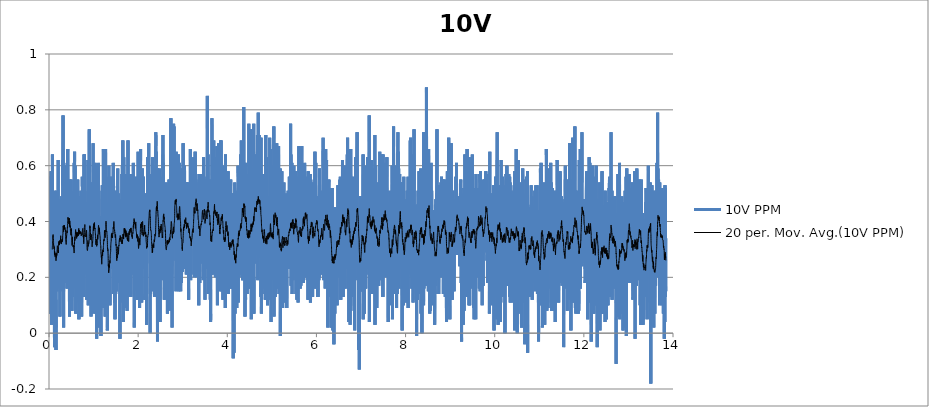
| Category | 10V PPM |
|---|---|
| 0.01620481575 | 0.37 |
| 0.019264157416666667 | 0.26 |
| 0.022323499055555557 | 0.07 |
| 0.025382562916666667 | 0.15 |
| 0.028442737944444445 | 0.22 |
| 0.03150207961111111 | 0.07 |
| 0.03456142125 | 0.56 |
| 0.03762076291666666 | 0.16 |
| 0.040680104555555555 | 0.38 |
| 0.04373944622222222 | 0.58 |
| 0.04679878786111111 | 0.25 |
| 0.04985785172222222 | 0.42 |
| 0.05291747116666667 | 0.34 |
| 0.055977090611111106 | 0.03 |
| 0.05903643225 | 0.39 |
| 0.062096329500000005 | 0.46 |
| 0.0651553933611111 | 0.27 |
| 0.0682155683888889 | 0.29 |
| 0.07127546561111112 | 0.44 |
| 0.07433452947222222 | 0.29 |
| 0.07739387113888889 | 0.64 |
| 0.08045349058333334 | 0.3 |
| 0.08351283222222222 | 0.38 |
| 0.0865721738888889 | 0.49 |
| 0.08963123775 | 0.2 |
| 0.09269085719444445 | 0.19 |
| 0.09575019883333334 | 0.2 |
| 0.09880926269444444 | 0.21 |
| 0.10186999330555556 | 0.21 |
| 0.10492933497222222 | 0.23 |
| 0.10798839880555555 | 0.29 |
| 0.11104774047222221 | 0.21 |
| 0.11410735991666666 | 0.33 |
| 0.11716781274999999 | 0.15 |
| 0.12022715438888888 | 0.37 |
| 0.12328677383333334 | -0.05 |
| 0.12634611547222221 | 0.25 |
| 0.12940545713888887 | 0.51 |
| 0.132464521 | 0.26 |
| 0.13552441822222222 | 0.27 |
| 0.13858375988888888 | 0.45 |
| 0.1416431015277778 | 0.47 |
| 0.14470244319444445 | 0.47 |
| 0.14776178483333335 | 0.48 |
| 0.15082112649999999 | 0.02 |
| 0.15388157930555554 | 0.12 |
| 0.15694064316666667 | -0.06 |
| 0.15999998483333333 | 0.33 |
| 0.1630604376388889 | 0.41 |
| 0.16611977930555558 | 0.19 |
| 0.16917884316666668 | 0.26 |
| 0.17223790700000002 | 0.51 |
| 0.17529752644444443 | 0.15 |
| 0.1783568681111111 | 0.39 |
| 0.18141593197222222 | 0.44 |
| 0.18447527361111113 | 0.16 |
| 0.18753461527777776 | 0.43 |
| 0.1905936791111111 | 0.46 |
| 0.19365274297222224 | 0.21 |
| 0.19671264022222223 | 0.26 |
| 0.19977198186111111 | 0.17 |
| 0.20283104572222224 | 0.37 |
| 0.20589010958333334 | 0.62 |
| 0.20894945125 | 0.31 |
| 0.21200934847222222 | 0.48 |
| 0.21506924572222222 | 0.16 |
| 0.21812969852777778 | 0.24 |
| 0.22118904019444444 | 0.27 |
| 0.22424865963888888 | 0.26 |
| 0.22730800127777778 | 0.35 |
| 0.23036706513888888 | 0.34 |
| 0.23342696238888888 | 0.24 |
| 0.2364863040277778 | 0.47 |
| 0.2395453678888889 | 0.32 |
| 0.24260498733333333 | 0.41 |
| 0.2456643289722222 | 0.06 |
| 0.2487236706388889 | 0.43 |
| 0.2517830122777778 | 0.47 |
| 0.2548429095277778 | 0.3 |
| 0.25790225116666665 | 0.48 |
| 0.2609618706111111 | 0.35 |
| 0.2640209344722222 | 0.4 |
| 0.2670802761388889 | 0.29 |
| 0.27013934 | 0.36 |
| 0.2731992372222222 | 0.26 |
| 0.2762583010833333 | 0.15 |
| 0.27931792052777776 | 0.18 |
| 0.2823772621666667 | 0.49 |
| 0.2854374372222222 | 0.16 |
| 0.2884970566666667 | 0.42 |
| 0.2915566761111111 | 0.47 |
| 0.29461657333333335 | 0.27 |
| 0.2976756371944444 | 0.38 |
| 0.30073497883333333 | 0.23 |
| 0.3037940426944445 | 0.46 |
| 0.3068533843611111 | 0.34 |
| 0.309912726 | 0.62 |
| 0.31297429 | 0.53 |
| 0.31604002091666666 | 0.78 |
| 0.3190996403611111 | 0.46 |
| 0.3221592598055556 | 0.45 |
| 0.32521887925 | 0.23 |
| 0.3282796098611111 | 0.02 |
| 0.3313403404722222 | 0.61 |
| 0.33440023772222227 | 0.19 |
| 0.3374601349722222 | 0.36 |
| 0.34052086558333333 | 0.27 |
| 0.34358131841666667 | 0.18 |
| 0.3466417712222222 | 0.44 |
| 0.3497011128888889 | 0.22 |
| 0.3527632324722222 | 0.42 |
| 0.3558228519166667 | 0.4 |
| 0.35888330475 | 0.25 |
| 0.36194570211111116 | 0.23 |
| 0.36501421097222225 | 0.48 |
| 0.36807605275 | 0.3 |
| 0.37114261705555557 | 0.5 |
| 0.3742025142777778 | 0.24 |
| 0.3772626893055555 | 0.38 |
| 0.38032453111111114 | 0.44 |
| 0.3833844283333333 | 0.27 |
| 0.38644543675 | 0.19 |
| 0.38950700075 | 0.6 |
| 0.3925688425555556 | 0.46 |
| 0.39562985097222225 | 0.38 |
| 0.3986961374722222 | 0.38 |
| 0.40175603469444443 | 0.57 |
| 0.40481593194444443 | 0.16 |
| 0.4078777737222222 | 0.31 |
| 0.41093878213888885 | 0.57 |
| 0.4139986793888889 | 0.52 |
| 0.41705913219444446 | 0.33 |
| 0.42011875163888884 | 0.66 |
| 0.42317809330555556 | 0.54 |
| 0.42623743494444444 | 0.43 |
| 0.4292970543888889 | 0.34 |
| 0.4323566738333333 | 0.33 |
| 0.43541712666666665 | 0.22 |
| 0.43847674611111115 | 0.37 |
| 0.4415388656944444 | 0.2 |
| 0.4445984851388889 | 0.43 |
| 0.44765782680555555 | 0.44 |
| 0.4507188352222222 | 0.49 |
| 0.45378539949999996 | 0.44 |
| 0.4568447411388889 | 0.49 |
| 0.4599040828055555 | 0.06 |
| 0.46296370225 | 0.31 |
| 0.46602415505555556 | 0.55 |
| 0.4690837745 | 0.23 |
| 0.4721433939722222 | 0.29 |
| 0.4752024578055556 | 0.42 |
| 0.4782617994722222 | 0.45 |
| 0.48132225230555553 | 0.25 |
| 0.48438187175 | 0.38 |
| 0.48744093558333335 | 0.38 |
| 0.4905005550277778 | 0.34 |
| 0.49355989669444444 | 0.29 |
| 0.49661896055555554 | 0.55 |
| 0.4996791355833333 | 0.33 |
| 0.5027387550277778 | 0.38 |
| 0.5057980966666666 | 0.16 |
| 0.5088577161111111 | 0.24 |
| 0.5119170577777777 | 0.3 |
| 0.5149763994166666 | 0.08 |
| 0.5180357410833333 | 0.3 |
| 0.5210950827222223 | 0.51 |
| 0.5241549799722222 | 0.46 |
| 0.5272143216111111 | 0.13 |
| 0.5302736632777778 | 0.23 |
| 0.5333330049166667 | 0.16 |
| 0.5363920687777778 | 0.37 |
| 0.5394514104166667 | 0.33 |
| 0.5425110298611111 | 0.29 |
| 0.5455706493055555 | 0.48 |
| 0.5486299909722222 | 0.31 |
| 0.5516904437777778 | 0.17 |
| 0.5547497854444444 | 0.23 |
| 0.5578096826666666 | 0.51 |
| 0.5608693021111111 | 0.26 |
| 0.5639291993611111 | 0.23 |
| 0.5669888188055555 | 0.61 |
| 0.5700489938333333 | 0.24 |
| 0.5731083355 | 0.65 |
| 0.5761676771388888 | 0.33 |
| 0.5792275743888889 | 0.4 |
| 0.5822869160277778 | 0.25 |
| 0.5853487578333333 | 0.6 |
| 0.5884086550555556 | 0.36 |
| 0.5914679967222223 | 0.3 |
| 0.5945273383611112 | 0.39 |
| 0.5975869578055555 | 0.48 |
| 0.60064657725 | 0.07 |
| 0.6037061966944445 | 0.39 |
| 0.6067652605555556 | 0.16 |
| 0.60982488 | 0.36 |
| 0.6128842216388889 | 0.28 |
| 0.6159438410833333 | 0.33 |
| 0.6190029049444444 | 0.11 |
| 0.6220628021944444 | 0.34 |
| 0.6251221438333333 | 0.52 |
| 0.6281820410833333 | 0.43 |
| 0.6312411049444444 | 0.36 |
| 0.634300724388889 | 0.48 |
| 0.6373608994166666 | 0.43 |
| 0.6404199632777777 | 0.3 |
| 0.6434793049166666 | 0.55 |
| 0.6465386465833333 | 0.4 |
| 0.6495990993888889 | 0.28 |
| 0.6526584410555555 | 0.49 |
| 0.6557175049166666 | 0.42 |
| 0.6587768465555556 | 0.29 |
| 0.6618359104166667 | 0.47 |
| 0.6648949742777778 | 0.24 |
| 0.6679545937222223 | 0.43 |
| 0.6710139353611111 | 0.05 |
| 0.6740732770277779 | 0.29 |
| 0.6771323408888889 | 0.2 |
| 0.6801922381111111 | 0.4 |
| 0.6832515797777777 | 0.27 |
| 0.6863109214166666 | 0.46 |
| 0.6893699852777778 | 0.3 |
| 0.6924296047222221 | 0.37 |
| 0.6954892241666667 | 0.49 |
| 0.6985499547777778 | 0.42 |
| 0.7016106854166666 | 0.43 |
| 0.7046700270555555 | 0.49 |
| 0.7077302020833333 | 0.48 |
| 0.7107903771111111 | 0.29 |
| 0.7138497187777778 | 0.35 |
| 0.7169090604166667 | 0.51 |
| 0.7199684020833333 | 0.16 |
| 0.7230277437222222 | 0.34 |
| 0.7260868075833333 | 0.28 |
| 0.7291461492222222 | 0.47 |
| 0.7322060464722222 | 0.06 |
| 0.7352651103333334 | 0.32 |
| 0.7383244519722223 | 0.25 |
| 0.741383793638889 | 0.3 |
| 0.7444439686666667 | 0.32 |
| 0.7475030325277777 | 0.56 |
| 0.7505623741666667 | 0.48 |
| 0.7536222714166667 | 0.45 |
| 0.756681890861111 | 0.53 |
| 0.7597412324999999 | 0.43 |
| 0.7628005741666666 | 0.29 |
| 0.765859638 | 0.23 |
| 0.7689189796666668 | 0.26 |
| 0.7719780435277778 | 0.44 |
| 0.7750371073888889 | 0.13 |
| 0.7780964490277777 | 0.13 |
| 0.7811560684722223 | 0.18 |
| 0.7842151323333333 | 0.58 |
| 0.7872805854444445 | 0.64 |
| 0.7903402048888889 | 0.37 |
| 0.7934001021111111 | 0.64 |
| 0.7964627773055555 | 0.39 |
| 0.7995229523333333 | 0.27 |
| 0.8025836829444445 | 0.45 |
| 0.8056483026944444 | 0.3 |
| 0.8087073665277777 | 0.32 |
| 0.8117678193611111 | 0.21 |
| 0.8148282721944444 | 0.41 |
| 0.8179112263055556 | 0.38 |
| 0.8210047365833334 | 0.35 |
| 0.8240715786666667 | 0.22 |
| 0.8271378651388889 | 0.3 |
| 0.8302341533611111 | 0.28 |
| 0.8332948839722222 | 0.36 |
| 0.8363586703333333 | 0.44 |
| 0.8394296793055556 | 0.23 |
| 0.8424995771111111 | 0.24 |
| 0.8455630856666667 | 0.35 |
| 0.8486377059722222 | 0.12 |
| 0.8517070481944444 | 0.21 |
| 0.8547772238055555 | 0.21 |
| 0.8578462882222223 | 0.36 |
| 0.8609147970833333 | 0.18 |
| 0.8639855282777777 | 0.47 |
| 0.8670629264999999 | 0.4 |
| 0.8701283796111111 | 0.51 |
| 0.8731957772777778 | 0.62 |
| 0.8762559523055555 | 0.2 |
| 0.8793405731944444 | 0.42 |
| 0.882412971138889 | 0.1 |
| 0.8854831467500001 | 0.36 |
| 0.888550266611111 | 0.34 |
| 0.8916207200277778 | 0.26 |
| 0.89468533975 | 0.44 |
| 0.8977502372777778 | 0.44 |
| 0.9008168015555555 | 0.43 |
| 0.9038803101111111 | 0.73 |
| 0.9069743759722222 | 0.48 |
| 0.9100401068888888 | 0.39 |
| 0.9131016708888888 | 0.21 |
| 0.9161707353055556 | 0.36 |
| 0.9192364662222222 | 0.18 |
| 0.9223096975555556 | 0.3 |
| 0.9253823733055555 | 0.37 |
| 0.92844671525 | 0.31 |
| 0.9315141129166666 | 0.16 |
| 0.9346031784722223 | 0.2 |
| 0.93768391025 | 0.49 |
| 0.9407485299722222 | 0.4 |
| 0.9438209279166666 | 0.06 |
| 0.9468924925 | 0.36 |
| 0.9499568344444445 | 0.51 |
| 0.9530231209166666 | 0.07 |
| 0.9560907963888889 | 0.43 |
| 0.9591590274444444 | 0.18 |
| 0.9622339255277779 | 0.38 |
| 0.9653029899722223 | 0.44 |
| 0.9683670541111111 | 0.38 |
| 0.9714330628055556 | 0.54 |
| 0.9744946268055557 | 0.38 |
| 0.9775598021111112 | 0.31 |
| 0.9806277553888889 | 0.34 |
| 0.9836982087777778 | 0.39 |
| 0.9867617173333334 | 0.59 |
| 0.9898296705833333 | 0.68 |
| 0.9929040130833333 | 0.35 |
| 0.9959686328333333 | 0.37 |
| 0.9990457532777778 | 0.36 |
| 1.0021114841666665 | 0.23 |
| 1.0051797152222222 | 0.55 |
| 1.0082732255 | 0.19 |
| 1.0113453456666666 | 0.3 |
| 1.0144141323055555 | 0.33 |
| 1.017506531388889 | 0.59 |
| 1.0205739290555556 | 0.21 |
| 1.0236579943333333 | 0.07 |
| 1.02672372525 | 0.4 |
| 1.029811401861111 | 0.28 |
| 1.032892967 | 0.61 |
| 1.0359750877222222 | 0.19 |
| 1.0390497080277779 | 0.18 |
| 1.0421309953888889 | 0.16 |
| 1.0452078380277778 | 0.36 |
| 1.0482696798333333 | 0.11 |
| 1.0513426333611111 | 0.49 |
| 1.0544441996666667 | 0.45 |
| 1.05753659875 | 0.49 |
| 1.0606017740833333 | 0.46 |
| 1.0636813946666666 | 0.3 |
| 1.0667543481944444 | 0.26 |
| 1.0698203569166667 | -0.02 |
| 1.072900810861111 | 0.42 |
| 1.0759909876111111 | 0.38 |
| 1.079068385861111 | 0.51 |
| 1.0821452285 | 0.29 |
| 1.0852242935 | 0.38 |
| 1.0883314156666666 | 0.6 |
| 1.0913993689166668 | 0.42 |
| 1.0944737114444445 | 0.29 |
| 1.0975466649722223 | 0.34 |
| 1.1006465645 | 0.32 |
| 1.1037395191944444 | 0.38 |
| 1.1068299737222222 | 0.61 |
| 1.1099054274166666 | 0.34 |
| 1.1130056047222223 | 0.48 |
| 1.1160841141388889 | 0.2 |
| 1.1191570676944445 | 0.51 |
| 1.1222719680833333 | 0.38 |
| 1.1253426992777777 | 0.02 |
| 1.1284198197222222 | 0.39 |
| 1.1314986069166666 | 0.29 |
| 1.1345998954166667 | 0.14 |
| 1.1376775714444445 | 0.33 |
| 1.1407677481944445 | 0.32 |
| 1.143864592 | 0.26 |
| 1.1469633803333332 | 0.26 |
| 1.150034667111111 | 0.41 |
| 1.1530981756666667 | 0.2 |
| 1.1561677956944443 | 0.18 |
| 1.1592404714444446 | 0.27 |
| 1.1623070357222223 | 0.28 |
| 1.1653749889722222 | -0.01 |
| 1.1684454423888888 | 0.42 |
| 1.17151728475 | 0.32 |
| 1.1745807933055554 | 0.25 |
| 1.1776495799444446 | 0.34 |
| 1.1807283671388888 | 0.17 |
| 1.183796876 | 0.1 |
| 1.1868745520277777 | 0.4 |
| 1.1899419496944446 | 0.42 |
| 1.1930087917777779 | 0.35 |
| 1.1960803563333333 | 0.53 |
| 1.199141086972222 | 0.29 |
| 1.2022040399166667 | 0.09 |
| 1.2052689374444445 | 0.47 |
| 1.2083402242222223 | 0.5 |
| 1.2114126221944443 | 0.25 |
| 1.2144758529444446 | 0.3 |
| 1.2175410282777777 | 0.09 |
| 1.2206195376666666 | 0.66 |
| 1.2236849907777776 | 0.36 |
| 1.226747110388889 | 0.32 |
| 1.2298114523055557 | 0.38 |
| 1.2328738496944445 | 0.45 |
| 1.2359351359166666 | 0.16 |
| 1.2390130897222222 | 0.46 |
| 1.2420793762222222 | 0.34 |
| 1.2451409402222222 | 0.52 |
| 1.2482086156944443 | 0.34 |
| 1.25127212425 | 0.49 |
| 1.2543372995555557 | 0.14 |
| 1.2574005303333333 | 0.46 |
| 1.2604654278333334 | 0.06 |
| 1.2635375480000002 | 0.42 |
| 1.2666024455277778 | 0.53 |
| 1.2696676208333333 | 0.66 |
| 1.2727280736666666 | 0.25 |
| 1.27579491575 | 0.46 |
| 1.2788553685833333 | 0.56 |
| 1.2819174881666666 | 0.43 |
| 1.2849804411388888 | 0.12 |
| 1.2880447830833333 | 0.26 |
| 1.2911080138333333 | 0.15 |
| 1.2941693000277776 | 0.47 |
| 1.297237808888889 | 0.17 |
| 1.3002988173055554 | 0.25 |
| 1.3033606590833333 | 0.29 |
| 1.3064227786666667 | 0.29 |
| 1.3094862872222222 | 0.01 |
| 1.3125764639722222 | 0.06 |
| 1.315646917388889 | 0.22 |
| 1.3187112593055557 | 0.24 |
| 1.3217733789166666 | 0.16 |
| 1.3248496659722224 | 0.15 |
| 1.3279128967222222 | 0.15 |
| 1.3309814055833333 | 0.12 |
| 1.334059081611111 | 0.38 |
| 1.3371187010555556 | 0.16 |
| 1.34018470975 | 0.24 |
| 1.34324627375 | 0.6 |
| 1.3463556182499998 | 0.12 |
| 1.3494169044722222 | 0.34 |
| 1.3524768016944444 | 0.45 |
| 1.35555447775 | 0.31 |
| 1.358627986861111 | 0.47 |
| 1.3617020515833331 | 0.31 |
| 1.3647708382222221 | 0.42 |
| 1.3678396248611113 | 0.1 |
| 1.370907578111111 | 0.34 |
| 1.373972475638889 | 0.3 |
| 1.3770398733055558 | 0.29 |
| 1.38009949275 | 0.37 |
| 1.3831646680555556 | 0.23 |
| 1.3862278988333332 | 0.56 |
| 1.3892891850277778 | 0.33 |
| 1.392348804472222 | 0.23 |
| 1.395409812888889 | 0.43 |
| 1.39852137975 | 0.52 |
| 1.4015904441666667 | 0.36 |
| 1.4046672868333334 | 0.37 |
| 1.4077335733333334 | 0.37 |
| 1.4108006931944443 | 0.42 |
| 1.41386420175 | 0.3 |
| 1.4169260435555555 | 0.28 |
| 1.419986496361111 | 0.31 |
| 1.4230477825833332 | 0.39 |
| 1.4261240696388888 | 0.32 |
| 1.4291925784722221 | 0.42 |
| 1.432258864972222 | 0.31 |
| 1.4353254292777777 | 0.35 |
| 1.4383958826666667 | 0.48 |
| 1.4414757810555556 | 0.61 |
| 1.4445415119444445 | 0.14 |
| 1.447609743 | 0.55 |
| 1.450673807138889 | 0.52 |
| 1.4537331488055556 | 0.5 |
| 1.4567994352777778 | 0.47 |
| 1.45986238825 | 0.27 |
| 1.462932008277778 | 0.14 |
| 1.4659946834444446 | 0.22 |
| 1.4690679147777779 | 0.39 |
| 1.4721311455555555 | 0.43 |
| 1.4751918761666667 | 0.11 |
| 1.4782526067777777 | 0.29 |
| 1.4813763965555555 | 0.05 |
| 1.4844396273333333 | 0.32 |
| 1.4875009135277777 | 0.26 |
| 1.4905641443055555 | 0.51 |
| 1.4936376534166667 | 0.47 |
| 1.4967033843333333 | 0.14 |
| 1.499776337861111 | 0.25 |
| 1.5028492914166665 | 0.25 |
| 1.505911411 | 0.25 |
| 1.5089813088055555 | 0.39 |
| 1.5120500954444445 | 0.15 |
| 1.5151147151666666 | 0.19 |
| 1.51817683475 | 0.2 |
| 1.5212372875833333 | 0.19 |
| 1.5242988515833333 | 0.44 |
| 1.5273584710277777 | 0.37 |
| 1.5304194794444446 | 0.25 |
| 1.5334807656388887 | 0.3 |
| 1.5365401073055556 | 0.18 |
| 1.5396027824722223 | 0.47 |
| 1.5426624019166666 | 0.59 |
| 1.5457264660555554 | 0.25 |
| 1.5487919191666666 | 0.24 |
| 1.5518590390555556 | 0.26 |
| 1.5549247699444444 | 0.3 |
| 1.5579846671944446 | 0.18 |
| 1.5610467867777778 | 0.42 |
| 1.5641205736944443 | 0.5 |
| 1.5671824155 | 0.43 |
| 1.5702423127222223 | 0.35 |
| 1.5733049879166667 | 0.39 |
| 1.5763643295555554 | 0.32 |
| 1.5794250601666666 | 0.29 |
| 1.5824849574166668 | 0.26 |
| 1.5855451324444445 | 0.35 |
| 1.588609474388889 | 0.48 |
| 1.5916727051388888 | -0.02 |
| 1.5947353803333333 | 0.47 |
| 1.5977974999166669 | 0.47 |
| 1.6008579527500002 | 0.28 |
| 1.6039203501111112 | 0.44 |
| 1.6069816363333334 | 0.37 |
| 1.610041811361111 | 0.15 |
| 1.6131008752222222 | 0.35 |
| 1.616163550388889 | 0.41 |
| 1.6192253921944444 | 0.15 |
| 1.6222955677777777 | 0.26 |
| 1.6253549094444444 | 0.39 |
| 1.6284303631111112 | 0.42 |
| 1.6314899825555556 | 0.37 |
| 1.6345507131944443 | 0.19 |
| 1.6376106104166666 | 0.57 |
| 1.6406707854444444 | 0.19 |
| 1.643730127111111 | 0.11 |
| 1.6467903021388888 | 0.6 |
| 1.6498529773055555 | 0.43 |
| 1.6529128745555555 | 0.19 |
| 1.6559774942777776 | 0.69 |
| 1.65904044725 | 0.51 |
| 1.6621000666944443 | 0.23 |
| 1.6651688533333333 | 0.51 |
| 1.6682365288055556 | 0.04 |
| 1.6713150382222224 | 0.4 |
| 1.6743749354444446 | 0.08 |
| 1.6774356660555554 | 0.63 |
| 1.6804950077222223 | 0.41 |
| 1.6835546271666666 | 0.52 |
| 1.6866184135 | 0.41 |
| 1.6896847 | 0.35 |
| 1.69274459725 | 0.22 |
| 1.6958050500555555 | 0.42 |
| 1.6988666140555557 | 0.23 |
| 1.7019287336666666 | 0.34 |
| 1.7049889086944445 | 0.27 |
| 1.7080493615277779 | 0.35 |
| 1.7111089809722222 | 0.19 |
| 1.714177212 | 0.57 |
| 1.7172376648333334 | 0.23 |
| 1.7202972842777777 | 0.53 |
| 1.723358570472222 | 0.44 |
| 1.7264223568333334 | 0.4 |
| 1.7294839208333332 | 0.35 |
| 1.7325443736666666 | 0.09 |
| 1.7356037153055557 | 0.24 |
| 1.7386691684166666 | 0.47 |
| 1.7417326769722223 | 0.3 |
| 1.7447934076111111 | 0.56 |
| 1.7478541382222224 | 0.5 |
| 1.75091431325 | 0.19 |
| 1.7539739326944443 | 0.08 |
| 1.757035218888889 | 0.39 |
| 1.7600948383333332 | 0.32 |
| 1.763155013388889 | 0.15 |
| 1.766217132972222 | 0.44 |
| 1.7692825860833332 | 0.24 |
| 1.7723613732777777 | 0.69 |
| 1.7754207149444445 | 0.21 |
| 1.7784833901111112 | 0.13 |
| 1.78154745425 | 0.39 |
| 1.7846098516388889 | 0.49 |
| 1.7876769715 | 0.37 |
| 1.7907413134444445 | 0.37 |
| 1.7938050998055557 | 0.57 |
| 1.7968841648055556 | 0.43 |
| 1.7999443398333335 | 0.34 |
| 1.8030042370555557 | 0.2 |
| 1.8060644121111111 | 0.54 |
| 1.8091287540277778 | 0.51 |
| 1.8122169862222222 | 0.27 |
| 1.815276327888889 | 0.4 |
| 1.8183365029166667 | 0.14 |
| 1.82139695575 | 0.53 |
| 1.8244587975277777 | 0.2 |
| 1.8275203615277777 | 0.47 |
| 1.8305805365555554 | 0.26 |
| 1.8336418227777778 | 0.57 |
| 1.8367042201388888 | 0.13 |
| 1.8397696732500002 | 0.22 |
| 1.8428331818055554 | 0.53 |
| 1.8458947458055557 | 0.23 |
| 1.8489554764444445 | 0.39 |
| 1.8520273188055556 | 0.21 |
| 1.855118884527778 | 0.4 |
| 1.8581798929444444 | 0.41 |
| 1.861240067972222 | 0.3 |
| 1.8643007985833333 | 0.31 |
| 1.8673623625833333 | 0.35 |
| 1.8704247599722224 | 0.46 |
| 1.8734918798333333 | 0.49 |
| 1.8765512215 | 0.51 |
| 1.879620008138889 | 0.24 |
| 1.8826857390277778 | 0.47 |
| 1.8857459140555557 | 0.39 |
| 1.888810256 | 0.49 |
| 1.8918704310277779 | 0.61 |
| 1.894933384 | 0.44 |
| 1.898012449 | 0.46 |
| 1.901074846388889 | 0.25 |
| 1.9041358548055556 | 0.48 |
| 1.9071982521666668 | 0.49 |
| 1.9102603717777777 | 0.44 |
| 1.913319991222222 | 0.02 |
| 1.9163879444722223 | 0.45 |
| 1.9194481195000002 | 0.18 |
| 1.92250801675 | 0.3 |
| 1.9255712475 | 0.32 |
| 1.9286333670833333 | 0.41 |
| 1.9316988201944443 | 0.27 |
| 1.934759828611111 | 0.49 |
| 1.937819725861111 | 0.3 |
| 1.9408860123333334 | 0.56 |
| 1.9439459095833334 | 0.55 |
| 1.9470099737222222 | 0.46 |
| 1.9500743156666667 | 0.37 |
| 1.9531350462777777 | 0.15 |
| 1.956195776888889 | 0.39 |
| 1.9592559519444444 | 0.4 |
| 1.962317793722222 | 0.19 |
| 1.9653790799444444 | 0.26 |
| 1.9684392549722223 | 0.36 |
| 1.97149943 | 0.38 |
| 1.9745584938611112 | 0.26 |
| 1.9776236691666669 | 0.29 |
| 1.9806843997777777 | 0.35 |
| 1.9837442970277779 | 0.12 |
| 1.9868041942777779 | 0.23 |
| 1.9898732586944445 | 0.24 |
| 1.9929409341666666 | 0.28 |
| 1.9960005536111112 | 0.43 |
| 1.9990648955277779 | 0.65 |
| 2.002144516138889 | 0.38 |
| 2.0052060801388887 | 0.12 |
| 2.008267644138889 | 0.23 |
| 2.0113289303333333 | 0.38 |
| 2.0143893831666664 | 0.28 |
| 2.0174495581944445 | 0.47 |
| 2.0205094554444445 | 0.51 |
| 2.0235685192777777 | 0.38 |
| 2.0266411950277776 | 0.39 |
| 2.0297088705 | 0.4 |
| 2.0327690455277776 | 0.09 |
| 2.0358292205555557 | 0.18 |
| 2.0388941180833333 | 0.2 |
| 2.0419554043055554 | 0.56 |
| 2.0450155793333336 | 0.48 |
| 2.048078810083333 | 0.56 |
| 2.0511398185 | 0.45 |
| 2.0542008269166665 | 0.66 |
| 2.05726127975 | 0.4 |
| 2.0603245105 | 0.43 |
| 2.0633994085833334 | 0.41 |
| 2.066459028027778 | 0.13 |
| 2.069520869833333 | 0.36 |
| 2.0725807670833336 | 0.51 |
| 2.0756417755 | 0.37 |
| 2.0787013949444444 | 0.11 |
| 2.0817757374444446 | 0.19 |
| 2.084835079083333 | 0.31 |
| 2.0878991432222223 | 0.42 |
| 2.0909598738611113 | 0.23 |
| 2.0940203266666666 | 0.59 |
| 2.0970796683333335 | 0.5 |
| 2.1001448436388888 | 0.34 |
| 2.103211963527778 | 0.39 |
| 2.1062874171944443 | 0.34 |
| 2.1093475922500002 | 0.3 |
| 2.1124066560833334 | 0.39 |
| 2.1154671089166666 | 0.23 |
| 2.1185381179166667 | 0.56 |
| 2.121608849083333 | 0.31 |
| 2.124671246472222 | 0.46 |
| 2.1277330882777776 | 0.3 |
| 2.1308018749166666 | 0.31 |
| 2.133861494361111 | 0.42 |
| 2.1369241695277776 | 0.48 |
| 2.1399865669166664 | 0.34 |
| 2.1430464641388887 | 0.37 |
| 2.1461077503611112 | 0.46 |
| 2.1491698699444446 | 0.12 |
| 2.1522392121666667 | 0.14 |
| 2.1552988316111112 | 0.45 |
| 2.158363729138889 | 0.39 |
| 2.161423070777778 | 0.34 |
| 2.1644824124444444 | 0.5 |
| 2.1675417540833335 | 0.37 |
| 2.17060109575 | 0.15 |
| 2.1736640486944445 | 0.19 |
| 2.1767356132777778 | 0.38 |
| 2.1797946771388887 | 0.12 |
| 2.182861519222222 | 0.23 |
| 2.1859219720555556 | 0.29 |
| 2.1889868695555554 | 0.03 |
| 2.1920492669444442 | 0.39 |
| 2.1951108309444445 | 0.49 |
| 2.198171005972222 | 0.43 |
| 2.201230069833333 | 0.34 |
| 2.2042955229444443 | 0.43 |
| 2.2073562535555555 | 0.38 |
| 2.2104178175555553 | 0.36 |
| 2.213478270388889 | 0.63 |
| 2.216538167638889 | 0.46 |
| 2.219602231777778 | 0.49 |
| 2.222669351638889 | 0.41 |
| 2.2257311934444446 | 0.48 |
| 2.2287916462777777 | 0.39 |
| 2.2318604329166667 | 0.37 |
| 2.2349253304166665 | 0.42 |
| 2.237988283388889 | 0.68 |
| 2.2410590145833336 | 0.39 |
| 2.2441236343333335 | 0.39 |
| 2.2471874206666667 | 0.43 |
| 2.250250095833333 | 0.32 |
| 2.2533113820555557 | 0.43 |
| 2.2563935027777777 | 0.57 |
| 2.2594531222222223 | 0.32 |
| 2.262512741666667 | 0.49 |
| 2.2655765280277778 | 0.25 |
| 2.2686414255555554 | 0 |
| 2.2717021561666666 | 0.4 |
| 2.274765664722222 | 0.14 |
| 2.277826117555555 | 0.26 |
| 2.2808943485833333 | 0.25 |
| 2.2839534124444447 | 0.37 |
| 2.2870133096944443 | 0.5 |
| 2.2900918191111113 | 0.36 |
| 2.293151994138889 | 0.26 |
| 2.2962121691666666 | 0.26 |
| 2.299273733166667 | 0.29 |
| 2.3023350193888885 | 0.28 |
| 2.305397138972222 | 0.15 |
| 2.308457314 | 0.23 |
| 2.311521933722222 | 0.33 |
| 2.3145846088888886 | 0.21 |
| 2.3176467285 | 0.4 |
| 2.320706625722222 | 0.63 |
| 2.323765967388889 | 0.23 |
| 2.326838920916667 | 0.52 |
| 2.3299004849166667 | 0.27 |
| 2.3329812166944444 | 0.2 |
| 2.3360458364166665 | 0.41 |
| 2.339108789388889 | 0.22 |
| 2.3421681310277775 | 0.24 |
| 2.3452271948888885 | 0.36 |
| 2.348287647722222 | 0.28 |
| 2.3513536564166664 | 0.39 |
| 2.3544163315833333 | 0.6 |
| 2.3574792845555557 | 0.32 |
| 2.360538626222222 | 0.44 |
| 2.363599634611111 | 0.14 |
| 2.3666606430277777 | 0.13 |
| 2.369723318222222 | 0.37 |
| 2.372783215444444 | 0.38 |
| 2.3758425571111115 | 0.56 |
| 2.3789024543333337 | 0.34 |
| 2.381962073777778 | 0.54 |
| 2.385026137916667 | 0.26 |
| 2.3880935355833333 | 0.56 |
| 2.391153155027778 | 0.35 |
| 2.3942133300833333 | 0.67 |
| 2.3972735051111114 | 0.72 |
| 2.4003334023333336 | 0.67 |
| 2.4033963553055555 | 0.61 |
| 2.406459308277778 | 0.65 |
| 2.409520594472222 | 0.25 |
| 2.412581880694445 | 0.53 |
| 2.4156490005555558 | 0.28 |
| 2.4187138980833334 | 0.37 |
| 2.4217768510555557 | 0.45 |
| 2.4248398040277777 | 0.48 |
| 2.4279216469722225 | 0.41 |
| 2.4309871000833336 | 0.11 |
| 2.434053664361111 | -0.03 |
| 2.4371141171944446 | 0.59 |
| 2.4401745700277777 | 0.32 |
| 2.44323446725 | 0.31 |
| 2.4462965868333333 | 0.09 |
| 2.4493567618611114 | 0.49 |
| 2.452416659111111 | 0.27 |
| 2.455481556638889 | 0.17 |
| 2.4585458985833335 | 0.41 |
| 2.4616049624166667 | 0.43 |
| 2.464685138611111 | 0.42 |
| 2.467746424805555 | 0.53 |
| 2.4708088221944444 | 0.33 |
| 2.4738681638333335 | 0.52 |
| 2.47692917225 | 0.59 |
| 2.479991291833333 | 0.55 |
| 2.4830581339166664 | 0.23 |
| 2.486118031166667 | 0.42 |
| 2.4891829286944445 | 0.54 |
| 2.4922422703333336 | 0.04 |
| 2.4953018897777777 | 0.42 |
| 2.498364287166667 | 0.25 |
| 2.5014277957222224 | 0.45 |
| 2.5044874151666665 | 0.22 |
| 2.507558146361111 | 0.35 |
| 2.5106222105000002 | 0.33 |
| 2.5136826633333333 | 0.22 |
| 2.5167464496666665 | 0.56 |
| 2.519819125416667 | 0.28 |
| 2.5228793004444445 | 0.19 |
| 2.5259411422499998 | 0.44 |
| 2.529001872861111 | 0.29 |
| 2.5320639924444444 | 0.3 |
| 2.5351247230833334 | 0.5 |
| 2.5381907317777777 | 0.31 |
| 2.5412500734166668 | 0.48 |
| 2.5443135819722222 | 0.29 |
| 2.547373757 | 0.49 |
| 2.5504369877777777 | 0.44 |
| 2.5534979961944444 | 0.64 |
| 2.5565581712222225 | 0.71 |
| 2.559621679777778 | 0.58 |
| 2.5626835215833332 | 0.39 |
| 2.565745363361111 | 0.61 |
| 2.5688083163333335 | 0.32 |
| 2.5718687691666666 | 0.43 |
| 2.574928666388889 | 0.29 |
| 2.5779902303888886 | 0.27 |
| 2.581052627777778 | 0.2 |
| 2.584111969416667 | 0.35 |
| 2.587173255638889 | 0.12 |
| 2.5902350974166666 | 0.29 |
| 2.593294439083333 | 0.17 |
| 2.5963573920555554 | 0.39 |
| 2.5994175670833335 | 0.23 |
| 2.6024780199166666 | 0.39 |
| 2.6055404172777776 | 0.24 |
| 2.608600314527778 | 0.21 |
| 2.6116635452777777 | 0.53 |
| 2.6147309429444445 | 0.3 |
| 2.617792229166667 | 0.23 |
| 2.6208579600555555 | 0.25 |
| 2.6239242465555557 | 0.27 |
| 2.626987477333333 | 0.54 |
| 2.6300473745555553 | 0.31 |
| 2.633107827388889 | 0.38 |
| 2.636168002416667 | 0.5 |
| 2.6392351223055552 | 0.26 |
| 2.6422961306944446 | 0.29 |
| 2.6453663063055557 | 0.4 |
| 2.648430092666667 | 0.39 |
| 2.6514911010833333 | 0.22 |
| 2.6545554429999996 | 0.34 |
| 2.65761534025 | 0.07 |
| 2.660674404111111 | 0.5 |
| 2.6637370792777775 | 0.29 |
| 2.6667972543055556 | 0.1 |
| 2.6698574293333333 | 0.35 |
| 2.6729173265833333 | 0.51 |
| 2.6759813907222223 | 0.24 |
| 2.679042676944445 | 0.25 |
| 2.682102574166667 | 0.4 |
| 2.6851688606666664 | 0.25 |
| 2.6882357027499997 | 0.53 |
| 2.691296988944444 | 0.26 |
| 2.6943577195833335 | 0.55 |
| 2.6974228948888888 | 0.31 |
| 2.700486125638889 | 0.46 |
| 2.7035457450833333 | 0.43 |
| 2.7066075868888886 | 0.31 |
| 2.709669150888889 | 0.32 |
| 2.712737104138889 | 0.23 |
| 2.7157995015277776 | 0.33 |
| 2.7188591209722226 | 0.46 |
| 2.7219240184999998 | 0.52 |
| 2.7249933607222223 | 0.34 |
| 2.7280554803055557 | 0.34 |
| 2.7311178776944445 | 0.08 |
| 2.734183886388889 | 0.77 |
| 2.7372443392222223 | 0.49 |
| 2.7403114590833337 | 0.49 |
| 2.7433744120555557 | 0.53 |
| 2.746450699111111 | 0.22 |
| 2.7495136520833334 | 0.43 |
| 2.752575771666667 | 0.24 |
| 2.7556381690555556 | 0.28 |
| 2.7587025109999996 | 0.21 |
| 2.761772964388889 | 0.02 |
| 2.7648325838333334 | 0.26 |
| 2.767893314444444 | 0.29 |
| 2.7709537672777778 | 0.29 |
| 2.7740150535 | 0.59 |
| 2.7770788398333335 | 0.41 |
| 2.780139014861111 | 0.43 |
| 2.783202801222222 | 0.58 |
| 2.7862649208055554 | 0.26 |
| 2.78932454025 | 0.26 |
| 2.7923872154166665 | 0.53 |
| 2.795449057222222 | 0.75 |
| 2.7985172882777776 | 0.33 |
| 2.8015791300555555 | 0.31 |
| 2.804646805527778 | 0.74 |
| 2.8077069805555555 | 0.57 |
| 2.8107702113055555 | 0.52 |
| 2.8138301085555555 | 0.34 |
| 2.8168900058055555 | 0.47 |
| 2.8199532365555555 | 0.48 |
| 2.8230511915277776 | 0.62 |
| 2.826115533472222 | 0.44 |
| 2.8291754306944443 | 0.46 |
| 2.832235050138889 | 0.42 |
| 2.8352988365 | 0.32 |
| 2.838358178138889 | 0.5 |
| 2.8414211311111113 | 0.63 |
| 2.844484361888889 | 0.56 |
| 2.8475573154166662 | 0.15 |
| 2.8506191572222224 | 0.35 |
| 2.853681832388889 | 0.65 |
| 2.8567556193055554 | 0.44 |
| 2.859816627722222 | 0.17 |
| 2.862887358916667 | 0.24 |
| 2.865948089527778 | 0.44 |
| 2.869008542361111 | 0.37 |
| 2.872068717388889 | 0.24 |
| 2.875130836972222 | 0.45 |
| 2.878191012 | 0.49 |
| 2.8812550761666667 | 0.62 |
| 2.8843188625 | 0.45 |
| 2.88737875975 | 0.32 |
| 2.8904522688611114 | 0.29 |
| 2.893512166111111 | 0.57 |
| 2.896572896722222 | 0.55 |
| 2.899634738527778 | 0.29 |
| 2.9027035251666664 | 0.64 |
| 2.9057673115 | 0.48 |
| 2.908830820055556 | 0.51 |
| 2.9118982177222223 | 0.15 |
| 2.9149642264166666 | 0.52 |
| 2.918025790416667 | 0.37 |
| 2.9210898545833333 | 0.56 |
| 2.9241533631388887 | 0.61 |
| 2.927241873111111 | 0.53 |
| 2.930330383111111 | 0.44 |
| 2.933400003111111 | 0.21 |
| 2.936462122694444 | 0.23 |
| 2.9395225755277776 | 0.27 |
| 2.942585806305556 | 0.3 |
| 2.945646259111111 | 0.25 |
| 2.9487106010555553 | 0.31 |
| 2.951780498861111 | 0.17 |
| 2.9548423406666666 | 0.15 |
| 2.9579091827500004 | 0.28 |
| 2.9609715801111114 | 0.5 |
| 2.9640334219166666 | 0.2 |
| 2.967097208277778 | 0.36 |
| 2.9701565499166667 | 0.36 |
| 2.9732195028888886 | 0.18 |
| 2.976280789083333 | 0.46 |
| 2.979340964111111 | 0.34 |
| 2.9824114175277776 | 0.27 |
| 2.985472148138889 | 0.26 |
| 2.9885331565555555 | 0.59 |
| 2.9915936093888886 | 0.22 |
| 2.99465434 | 0.42 |
| 2.997715904 | 0.51 |
| 3.0007771901944444 | 0.33 |
| 3.0038390319999997 | 0.32 |
| 3.006912541138889 | 0.28 |
| 3.0099729939444444 | 0.68 |
| 3.01306511525 | 0.41 |
| 3.016126401472222 | 0.45 |
| 3.0191957436944445 | 0.45 |
| 3.022257029888889 | 0.26 |
| 3.0253180383055556 | 0.45 |
| 3.0283812690555556 | 0.36 |
| 3.0314714458055554 | 0.32 |
| 3.034538010111111 | 0.43 |
| 3.0375970739722225 | 0.23 |
| 3.0406589157500004 | 0.6 |
| 3.043722702111111 | 0.31 |
| 3.046788155222222 | 0.51 |
| 3.0498502748055554 | 0.38 |
| 3.0529096164444445 | 0.35 |
| 3.055970069277778 | 0.38 |
| 3.059034689 | 0.42 |
| 3.0620979197777776 | 0.25 |
| 3.065157539222222 | 0.54 |
| 3.0682213255555557 | 0.49 |
| 3.0712826117777774 | 0.26 |
| 3.0743425089999996 | 0.51 |
| 3.0774051841944443 | 0.4 |
| 3.080468970527778 | 0.21 |
| 3.0835285899722225 | 0.32 |
| 3.0865904317777777 | 0.22 |
| 3.0896522735833334 | 0.5 |
| 3.0927118930277775 | 0.54 |
| 3.095778457305556 | 0.45 |
| 3.09883807675 | 0.23 |
| 3.1019024186944444 | 0.52 |
| 3.1049631493055556 | 0.34 |
| 3.1080244355 | 0.33 |
| 3.111088499638889 | 0.54 |
| 3.1141970107777777 | 0.45 |
| 3.1172574636111112 | 0.21 |
| 3.1203256946666666 | 0.25 |
| 3.123385591888889 | 0.38 |
| 3.126452433972222 | 0.46 |
| 3.1295173315 | 0.47 |
| 3.1325872293055554 | 0.12 |
| 3.135647126555556 | 0.38 |
| 3.1387173021388888 | 0.26 |
| 3.1417769215833333 | 0.35 |
| 3.144836541027778 | 0.35 |
| 3.147896993861111 | 0.36 |
| 3.1509566133055555 | 0.29 |
| 3.1540203996666665 | 0.31 |
| 3.1570811302777777 | 0.26 |
| 3.160141305305556 | 0.28 |
| 3.1632059250555553 | 0.49 |
| 3.1662672112499997 | 0.31 |
| 3.1693387758333333 | 0.27 |
| 3.172400062027778 | 0.66 |
| 3.1754649595555557 | 0.21 |
| 3.1785262457499996 | 0.19 |
| 3.181586143 | 0.41 |
| 3.1846482625833334 | 0.32 |
| 3.1877081598333334 | 0.22 |
| 3.190768612638889 | 0.21 |
| 3.1938343435555554 | 0.3 |
| 3.196922020166667 | 0.45 |
| 3.1999835841666666 | 0.47 |
| 3.203043203611111 | 0.36 |
| 3.206103378638889 | 0.37 |
| 3.209166609388889 | 0.49 |
| 3.212227340027778 | 0.45 |
| 3.2152902930000002 | 0.5 |
| 3.218351857 | 0.35 |
| 3.221413143194445 | 0.32 |
| 3.224473318222222 | 0.41 |
| 3.2275326598888885 | 0.34 |
| 3.23059505725 | 0.45 |
| 3.233660510361111 | 0.38 |
| 3.2367234633333335 | 0.44 |
| 3.2397850273333333 | 0.47 |
| 3.2428479803055557 | 0.56 |
| 3.245908710916667 | 0.63 |
| 3.2489736084444445 | 0.33 |
| 3.2520390615555557 | 0.61 |
| 3.255098403222222 | 0.57 |
| 3.258159411638889 | 0.5 |
| 3.261224031361111 | 0.2 |
| 3.264283650805556 | 0.22 |
| 3.2673541041944443 | 0.44 |
| 3.2704156681944445 | 0.5 |
| 3.2734752876388886 | 0.5 |
| 3.2765354626666667 | 0.37 |
| 3.2796006380000002 | 0.65 |
| 3.2826627575833336 | 0.49 |
| 3.285725710555556 | 0.61 |
| 3.2887911636666662 | 0.45 |
| 3.2918505053055553 | 0.39 |
| 3.294910958138889 | 0.53 |
| 3.29797168875 | 0.55 |
| 3.3010338083333335 | 0.53 |
| 3.304093983388889 | 0.48 |
| 3.3071544361944447 | 0.47 |
| 3.310218222555555 | 0.2 |
| 3.313277842 | 0.26 |
| 3.3163369058611107 | 0.43 |
| 3.31940735925 | 0.52 |
| 3.3224708678055555 | 0.41 |
| 3.3255321540277776 | 0.51 |
| 3.32859205125 | 0.24 |
| 3.331660282305555 | 0.37 |
| 3.3347204573333333 | 0.3 |
| 3.3377842436944447 | 0.45 |
| 3.340844974305556 | 0.34 |
| 3.3439065383055553 | 0.41 |
| 3.3469675467222224 | 0.34 |
| 3.3500274439444446 | 0.39 |
| 3.353092063694444 | 0.38 |
| 3.3561516831388887 | 0.49 |
| 3.3592149138888887 | 0.1 |
| 3.3622753667222223 | 0.54 |
| 3.3653372085 | 0.33 |
| 3.368404328388889 | 0.57 |
| 3.3714656145833337 | 0.3 |
| 3.3745269008055554 | 0.23 |
| 3.3775904093611113 | 0.3 |
| 3.3806500288055554 | 0.22 |
| 3.383715481916667 | 0.18 |
| 3.3867753791388893 | 0.51 |
| 3.389838332111111 | 0.5 |
| 3.392898507138889 | 0.4 |
| 3.395959793361111 | 0.46 |
| 3.399019968388889 | 0.45 |
| 3.402081532388889 | 0.41 |
| 3.405140874027778 | 0.48 |
| 3.408200771277778 | 0.51 |
| 3.411271502472222 | 0.47 |
| 3.414330844111111 | 0.39 |
| 3.4173932415 | 0.41 |
| 3.4204528609444442 | 0.25 |
| 3.4235119248055557 | 0.57 |
| 3.426574322194444 | 0.41 |
| 3.4296411642777773 | 0.52 |
| 3.4327030060555557 | 0.55 |
| 3.435762347722222 | 0.41 |
| 3.438821689361111 | 0.53 |
| 3.441881586611111 | 0.31 |
| 3.44494565075 | 0.26 |
| 3.4480113816388887 | 0.37 |
| 3.4510732234444443 | 0.36 |
| 3.4541331206944443 | 0.44 |
| 3.457193295722222 | 0.43 |
| 3.460254304138889 | 0.19 |
| 3.4633150347500004 | 0.3 |
| 3.4663763209444443 | 0.63 |
| 3.46943816275 | 0.53 |
| 3.4725011157222223 | 0.47 |
| 3.4755612907500004 | 0.56 |
| 3.478621187972222 | 0.53 |
| 3.481682196388889 | 0.47 |
| 3.4847451493611112 | 0.47 |
| 3.48780588 | 0.55 |
| 3.490865221638889 | 0.28 |
| 3.493926230055555 | 0.36 |
| 3.4969880718333335 | 0.24 |
| 3.5000532471666665 | 0.12 |
| 3.5031137 | 0.46 |
| 3.5061758195833335 | 0.3 |
| 3.5092365501944442 | 0.35 |
| 3.5122978363888886 | 0.51 |
| 3.5153605115833333 | 0.48 |
| 3.518420964388889 | 0.55 |
| 3.521493362361111 | 0.42 |
| 3.524552981805556 | 0.5 |
| 3.52761260125 | 0.28 |
| 3.5306802766944445 | 0.52 |
| 3.5337429518888888 | 0.47 |
| 3.536806182638889 | 0.47 |
| 3.5398688578055553 | 0.43 |
| 3.542930699611111 | 0.48 |
| 3.545995041555556 | 0.42 |
| 3.549056049972222 | 0.63 |
| 3.552117058388889 | 0.85 |
| 3.555179177972222 | 0.23 |
| 3.558240186388889 | 0.33 |
| 3.5613003614166665 | 0.38 |
| 3.5643602586388887 | 0.38 |
| 3.567426545138889 | 0.42 |
| 3.5704861645833335 | 0.64 |
| 3.5735460618333335 | 0.14 |
| 3.5766106815555556 | 0.38 |
| 3.5796708565833333 | 0.39 |
| 3.582734642944444 | 0.4 |
| 3.5857953735555554 | 0.45 |
| 3.588856381972222 | 0.38 |
| 3.5919207239166666 | 0.35 |
| 3.5949797877500003 | 0.47 |
| 3.5980566304166666 | 0.41 |
| 3.601117361027778 | 0.23 |
| 3.604180314 | 0.55 |
| 3.6072399334444447 | 0.41 |
| 3.6103034419999998 | 0.36 |
| 3.613364172611111 | 0.46 |
| 3.6164240698611114 | 0.39 |
| 3.6194836893055555 | 0.12 |
| 3.622544697722222 | 0.31 |
| 3.6256070951111115 | 0.04 |
| 3.6286678257222222 | 0.07 |
| 3.6317296674999997 | 0.28 |
| 3.634789009166667 | 0.48 |
| 3.6378483508055552 | 0.33 |
| 3.6409082480555557 | 0.41 |
| 3.6439678675 | 0.45 |
| 3.647029987083333 | 0.22 |
| 3.6500904399166667 | 0.21 |
| 3.653156448611111 | 0.52 |
| 3.65622523525 | 0.77 |
| 3.6592848546944445 | 0.41 |
| 3.6623447519166668 | 0.48 |
| 3.66540520475 | 0.47 |
| 3.6684651020000003 | 0.5 |
| 3.671524999222222 | 0.42 |
| 3.6745846186666666 | 0.48 |
| 3.677643960333333 | 0.36 |
| 3.6807102468055555 | 0.23 |
| 3.683772088611111 | 0.21 |
| 3.686834486 | 0.33 |
| 3.68989605 | 0.52 |
| 3.6929562250277774 | 0.6 |
| 3.6960155666666665 | 0.69 |
| 3.699076297305556 | 0.41 |
| 3.70213591675 | 0.44 |
| 3.7052013698611113 | 0.3 |
| 3.7082607115 | 0.57 |
| 3.711321442111111 | 0.42 |
| 3.7143827283333333 | 0.61 |
| 3.7174470702777778 | 0.31 |
| 3.720507245305556 | 0.31 |
| 3.723571865027778 | 0.63 |
| 3.726631484472222 | 0.48 |
| 3.7296958264166666 | 0.4 |
| 3.732756557027778 | 0.2 |
| 3.73581784325 | 0.41 |
| 3.7388780182777777 | 0.47 |
| 3.74194430475 | 0.21 |
| 3.7450053131666667 | 0.25 |
| 3.7480924341944446 | 0.43 |
| 3.7511520536388887 | 0.44 |
| 3.75421584 | 0.57 |
| 3.7572865711666665 | 0.45 |
| 3.760347024 | 0.42 |
| 3.763411921527778 | 0.43 |
| 3.766472652138889 | 0.67 |
| 3.7695358829166667 | 0.51 |
| 3.7725977246944447 | 0.44 |
| 3.7756615110555556 | 0.21 |
| 3.7787244640277775 | 0.1 |
| 3.781786583611111 | 0.47 |
| 3.784848147611111 | 0.36 |
| 3.7879138785277777 | 0.31 |
| 3.790974609138889 | 0.66 |
| 3.794037284305556 | 0.37 |
| 3.797099126111111 | 0.17 |
| 3.8001773577222226 | 0.44 |
| 3.8032369771666668 | 0.68 |
| 3.80629909675 | 0.4 |
| 3.8093598273888887 | 0.24 |
| 3.812419724611111 | 0.27 |
| 3.8154790662777778 | 0.35 |
| 3.8185400746666662 | 0.31 |
| 3.8216005275 | 0.42 |
| 3.8246598691666667 | 0.32 |
| 3.827727544611111 | 0.15 |
| 3.83081855475 | 0.57 |
| 3.833889563722222 | 0.34 |
| 3.8369494609722223 | 0.2 |
| 3.8400096359999996 | 0.51 |
| 3.8430756446944447 | 0.41 |
| 3.8461444313333333 | 0.45 |
| 3.8492059953333335 | 0.49 |
| 3.8522672815555556 | 0.69 |
| 3.855342735222222 | 0.36 |
| 3.8584040214444446 | 0.42 |
| 3.861464196472222 | 0.69 |
| 3.864523538111111 | 0.57 |
| 3.8675839909444445 | 0.29 |
| 3.870644999361111 | 0.32 |
| 3.873705729972222 | 0.38 |
| 3.876765627222222 | 0.48 |
| 3.8798285801666665 | 0.15 |
| 3.8828887552222224 | 0.39 |
| 3.885950597 | 0.41 |
| 3.8890141055555554 | 0.41 |
| 3.8920748361944444 | 0.2 |
| 3.895134455638889 | 0.22 |
| 3.898197408583333 | 0.2 |
| 3.9012598059722223 | 0.32 |
| 3.904328592611111 | 0.12 |
| 3.9073946013055556 | 0.46 |
| 3.9104578320833334 | 0.2 |
| 3.9135196738611113 | 0.55 |
| 3.916586238166667 | 0.41 |
| 3.9196466909722223 | 0.6 |
| 3.922707699388889 | 0.3 |
| 3.9257673188333335 | 0.28 |
| 3.928829438416667 | 0.46 |
| 3.931899336222222 | 0.2 |
| 3.9349589556666666 | 0.19 |
| 3.9380202418888888 | 0.54 |
| 3.941084306027778 | 0.35 |
| 3.9441447588611114 | 0.33 |
| 3.9472093785833335 | 0.41 |
| 3.950273442722222 | 0.22 |
| 3.953334173361111 | 0.48 |
| 3.9563960151388886 | 0.09 |
| 3.959458412527778 | 0.64 |
| 3.9625213655000002 | 0.43 |
| 3.9655954301944445 | 0.51 |
| 3.968659216555556 | 0.44 |
| 3.971730781138889 | 0.57 |
| 3.9747906783611113 | 0.31 |
| 3.9778502978055554 | 0.26 |
| 3.980910195055556 | 0.3 |
| 3.983970092277778 | 0.35 |
| 3.9870361009999997 | 0.23 |
| 3.990102387472222 | 0.52 |
| 3.993170340722222 | 0.5 |
| 3.9962327381111113 | 0.21 |
| 3.9992945799166666 | 0.26 |
| 4.002361144194444 | 0.22 |
| 4.005422152611112 | 0.25 |
| 4.008481494250001 | 0.26 |
| 4.011541113694444 | 0.31 |
| 4.014607955777778 | 0.3 |
| 4.01767090875 | 0.39 |
| 4.0207344173055555 | 0.58 |
| 4.0237943145555555 | 0.14 |
| 4.026860878833333 | 0.2 |
| 4.029927998722222 | 0.32 |
| 4.032989284916667 | 0.39 |
| 4.036050015527778 | 0.19 |
| 4.039112135111111 | 0.43 |
| 4.042172587944445 | 0.46 |
| 4.045232207388889 | 0.19 |
| 4.0482915490555555 | 0.22 |
| 4.051354502000001 | 0.33 |
| 4.05441439925 | 0.31 |
| 4.05747596325 | 0.49 |
| 4.0605355826944445 | 0.31 |
| 4.063619925777778 | 0.27 |
| 4.066679545222222 | 0.19 |
| 4.06973972025 | 0.37 |
| 4.072799061916666 | 0.16 |
| 4.075863681638889 | 0.55 |
| 4.078925801222222 | 0.34 |
| 4.082001254916666 | 0.27 |
| 4.085068930361111 | 0.31 |
| 4.088132716722222 | 0.29 |
| 4.091193447333334 | 0.33 |
| 4.094259456027777 | 0.22 |
| 4.097321853416667 | 0.27 |
| 4.100388973277777 | 0.45 |
| 4.103451092888889 | 0.5 |
| 4.106526546555556 | 0.41 |
| 4.1095939442222225 | 0.16 |
| 4.112659397333333 | 0.47 |
| 4.115730406333333 | 0.3 |
| 4.118794470472222 | 0.22 |
| 4.121854367694445 | 0.36 |
| 4.124913431555556 | 0.35 |
| 4.127977495722222 | 0.28 |
| 4.13103767075 | 0.46 |
| 4.134102568277778 | -0.09 |
| 4.137162187722222 | 0.32 |
| 4.140225418472222 | 0.5 |
| 4.143287815861111 | 0.24 |
| 4.146348824277778 | 0.18 |
| 4.149415388555555 | 0.09 |
| 4.1524780637222225 | -0.07 |
| 4.155540738888889 | 0.35 |
| 4.15860452525 | 0.38 |
| 4.161664700277777 | 0.12 |
| 4.164750987916666 | 0.26 |
| 4.16781144075 | 0.54 |
| 4.170872449166667 | 0.37 |
| 4.173934846527778 | 0.07 |
| 4.17699613275 | 0.45 |
| 4.180058807916667 | 0.32 |
| 4.183126205583333 | 0.27 |
| 4.186186658416667 | 0.15 |
| 4.189246277861111 | 0.12 |
| 4.192306730694445 | 0.51 |
| 4.195366072333333 | 0.45 |
| 4.198430136472222 | 0.21 |
| 4.2014997565000005 | 0.42 |
| 4.204565765194444 | 0.5 |
| 4.207629551555556 | 0.33 |
| 4.210689171 | 0.28 |
| 4.2137490682222225 | 0.09 |
| 4.216816743694444 | 0.33 |
| 4.2198771965277775 | 0.42 |
| 4.222939593888889 | 0.33 |
| 4.22599865775 | 0.23 |
| 4.2290582771944445 | 0.37 |
| 4.232119841194444 | 0.35 |
| 4.235185572111111 | 0.25 |
| 4.238246024916666 | 0.29 |
| 4.241305644361111 | 0.6 |
| 4.244365263805555 | 0.56 |
| 4.2474407175 | 0.11 |
| 4.250501170333333 | 0.52 |
| 4.253564956666667 | 0.39 |
| 4.256625965083333 | 0.45 |
| 4.259685862333334 | 0.5 |
| 4.262747981916667 | 0.37 |
| 4.265810934888889 | 0.2 |
| 4.268870276527777 | 0.36 |
| 4.271932118333334 | 0.37 |
| 4.274999516 | 0.21 |
| 4.2780610800000005 | 0.46 |
| 4.2811245885555556 | 0.47 |
| 4.284186430361111 | 0.33 |
| 4.287253828027778 | 0.22 |
| 4.290319281138888 | 0.36 |
| 4.293379456166667 | 0.55 |
| 4.296444075888889 | 0.45 |
| 4.299509251194444 | 0.32 |
| 4.302568870666667 | 0.64 |
| 4.305639601833334 | 0.22 |
| 4.308699776888889 | 0.29 |
| 4.3117655077777775 | 0.38 |
| 4.314828182944445 | 0.69 |
| 4.317896414 | 0.43 |
| 4.32095631125 | 0.52 |
| 4.324016764055556 | 0.54 |
| 4.327081661583334 | 0.41 |
| 4.330143503388888 | 0.43 |
| 4.333205900777778 | 0.42 |
| 4.336268575944445 | 0.64 |
| 4.33933041775 | 0.64 |
| 4.342390037194445 | 0.19 |
| 4.345452712361111 | 0.58 |
| 4.3485262214722225 | 0.19 |
| 4.351588341083334 | 0.43 |
| 4.354648238305556 | 0.31 |
| 4.35771258025 | 0.34 |
| 4.360775811 | 0.46 |
| 4.3638365416388885 | 0.23 |
| 4.3668989389999995 | 0.44 |
| 4.369961891972222 | 0.81 |
| 4.373027345083333 | 0.59 |
| 4.376086964527778 | 0.46 |
| 4.379148528527778 | 0.61 |
| 4.382208147972222 | 0.39 |
| 4.3852686008055555 | 0.42 |
| 4.388329609222222 | 0.43 |
| 4.391395340138889 | 0.42 |
| 4.3944577375 | 0.52 |
| 4.397522635027777 | 0.06 |
| 4.400588921527778 | 0.34 |
| 4.4036518745 | 0.33 |
| 4.4067214945 | 0.35 |
| 4.4097836140833335 | 0.12 |
| 4.412845733694445 | 0.37 |
| 4.41591729825 | 0.61 |
| 4.418976639916667 | 0.2 |
| 4.422037370527778 | 0.35 |
| 4.425097267777778 | 0.46 |
| 4.428156887222222 | 0.3 |
| 4.431216228861111 | 0.37 |
| 4.434279459611111 | 0.26 |
| 4.4373385234722225 | 0.54 |
| 4.440399809694445 | 0.57 |
| 4.443462207055556 | 0.33 |
| 4.446523771055555 | 0.14 |
| 4.4495833905 | 0.47 |
| 4.45264328775 | 0.2 |
| 4.455704018361111 | 0.48 |
| 4.458763915611112 | 0.28 |
| 4.461826035194445 | 0.25 |
| 4.464885376861111 | 0.51 |
| 4.467945829666666 | 0.16 |
| 4.471008227055555 | 0.51 |
| 4.474069235472222 | 0.23 |
| 4.4771294105 | 0.2 |
| 4.480190418916666 | 0.29 |
| 4.483250038361111 | 0.75 |
| 4.486310213388889 | 0.41 |
| 4.489372055194444 | 0.16 |
| 4.492433896972222 | 0.33 |
| 4.495494349805556 | 0.28 |
| 4.498559247333334 | 0.48 |
| 4.5016222003055555 | 0.4 |
| 4.504687931194445 | 0.64 |
| 4.507752828722222 | 0.33 |
| 4.5108132815555555 | 0.2 |
| 4.513878734666666 | 0.47 |
| 4.5169402986666665 | 0.43 |
| 4.5200043628055555 | 0.35 |
| 4.523065093416666 | 0.23 |
| 4.5261277686111105 | 0.73 |
| 4.529188499222222 | 0.28 |
| 4.532247840861111 | 0.46 |
| 4.535309127083333 | 0.42 |
| 4.538370413277778 | 0.05 |
| 4.5414305883055555 | 0.36 |
| 4.544494096861111 | 0.31 |
| 4.547570383944445 | 0.41 |
| 4.550630003388889 | 0.29 |
| 4.553703512499999 | 0.52 |
| 4.556766465472222 | 0.28 |
| 4.559828029472222 | 0.59 |
| 4.562887926722222 | 0.47 |
| 4.565951435277778 | 0.42 |
| 4.569012443694444 | 0.37 |
| 4.572079841361111 | 0.47 |
| 4.575143627694445 | 0.32 |
| 4.578207414055556 | 0.49 |
| 4.581277867444444 | 0.38 |
| 4.584342764972222 | 0.4 |
| 4.587404051194444 | 0.51 |
| 4.59047089325 | 0.56 |
| 4.593530512694445 | 0.75 |
| 4.596593187888889 | 0.07 |
| 4.599656418638888 | 0.2 |
| 4.6027174270555555 | 0.51 |
| 4.605782324583333 | 0.52 |
| 4.608847222111111 | 0.54 |
| 4.6119085083055555 | 0.54 |
| 4.614975072611111 | 0.44 |
| 4.618035247638889 | 0.46 |
| 4.621094867083333 | 0.5 |
| 4.624158931222222 | 0.25 |
| 4.627219939638889 | 0.58 |
| 4.630289837444444 | 0.47 |
| 4.633350845861111 | 0.4 |
| 4.636411298694444 | 0.36 |
| 4.639478696361111 | 0.55 |
| 4.642543038277778 | 0.28 |
| 4.645609324777778 | 0.47 |
| 4.648674222305556 | 0.48 |
| 4.651740786583333 | 0.44 |
| 4.654800683833334 | 0.64 |
| 4.657861970027778 | 0.48 |
| 4.660926034166667 | 0.51 |
| 4.663986487 | 0.55 |
| 4.667048050999999 | 0.45 |
| 4.670107392666667 | 0.33 |
| 4.6731664565 | 0.65 |
| 4.676237187694444 | 0.71 |
| 4.679297640527778 | 0.42 |
| 4.6823617046666675 | 0.52 |
| 4.685423268666667 | 0.19 |
| 4.688482610333334 | 0.36 |
| 4.691545007694445 | 0.59 |
| 4.694607682888889 | 0.79 |
| 4.697670635861112 | 0.35 |
| 4.700730810888889 | 0.27 |
| 4.703792097083333 | 0.4 |
| 4.7068525499166665 | 0.41 |
| 4.709914113916667 | 0.32 |
| 4.712973455555556 | 0.55 |
| 4.716033352805556 | 0.71 |
| 4.7190971391388885 | 0.33 |
| 4.722157314194444 | 0.59 |
| 4.725238879333333 | 0.39 |
| 4.728300721111111 | 0.4 |
| 4.731369785555556 | 0.56 |
| 4.7344341275 | 0.42 |
| 4.737495135888889 | 0.47 |
| 4.740555310944444 | 0.35 |
| 4.7436185416944445 | 0.39 |
| 4.746679272305555 | 0.38 |
| 4.749740558527778 | 0.34 |
| 4.7528049004722215 | 0.13 |
| 4.7558672978333325 | 0.7 |
| 4.758926917277778 | 0.26 |
| 4.761988481277777 | 0.18 |
| 4.765049489694444 | 0.07 |
| 4.768114387222222 | 0.2 |
| 4.771175117833333 | 0.14 |
| 4.774235292861111 | 0.49 |
| 4.777297690249999 | 0.45 |
| 4.780361198805555 | 0.5 |
| 4.783424985166667 | 0.43 |
| 4.78648710475 | 0.23 |
| 4.7895472797777785 | 0.43 |
| 4.792607732611112 | 0.24 |
| 4.795670407777777 | 0.57 |
| 4.798729749444444 | 0.39 |
| 4.801791313444444 | 0.33 |
| 4.80485648875 | 0.44 |
| 4.807926664361111 | 0.2 |
| 4.810988783944444 | 0.39 |
| 4.814053125888889 | 0.29 |
| 4.817116356638889 | 0.26 |
| 4.820179309611111 | 0.47 |
| 4.823255596666667 | 0.57 |
| 4.826323272138889 | 0.38 |
| 4.829392614361112 | 0.16 |
| 4.832451956000001 | 0.19 |
| 4.83552046486111 | 0.36 |
| 4.838611752777778 | 0.22 |
| 4.841675539111111 | 0.38 |
| 4.844736547527778 | 0.14 |
| 4.84779783375 | 0.27 |
| 4.850857175388889 | 0.34 |
| 4.853916517055556 | 0.12 |
| 4.856975858694445 | 0.56 |
| 4.860034922555555 | 0.37 |
| 4.863101209055555 | 0.71 |
| 4.866167773333333 | 0.21 |
| 4.869231281888888 | 0.17 |
| 4.872294790444444 | 0.34 |
| 4.875355521055555 | 0.35 |
| 4.878415973888889 | 0.63 |
| 4.881477260083334 | 0.37 |
| 4.8845368795277775 | 0.28 |
| 4.887598443527778 | 0.21 |
| 4.890660007555556 | 0.48 |
| 4.893719904777778 | 0.27 |
| 4.896780079805556 | 0.39 |
| 4.899846366305556 | 0.46 |
| 4.902908208111111 | 0.1 |
| 4.905967827555556 | 0.1 |
| 4.909028558166667 | 0.46 |
| 4.912089011 | 0.36 |
| 4.915150297194444 | 0.33 |
| 4.918210472222222 | 0.49 |
| 4.92127759211111 | 0.27 |
| 4.9243386005 | 0.47 |
| 4.927398219972223 | 0.31 |
| 4.930459506166667 | 0.43 |
| 4.933519125611111 | 0.36 |
| 4.936578189472223 | 0.43 |
| 4.939639475666667 | 0.48 |
| 4.9427040954166666 | 0.34 |
| 4.94576315925 | 0.13 |
| 4.94882388988889 | 0.27 |
| 4.951887120638889 | 0.7 |
| 4.954948962444444 | 0.33 |
| 4.958011915416667 | 0.41 |
| 4.9610709792500005 | 0.22 |
| 4.9641350434166664 | 0.66 |
| 4.96719882975 | 0.35 |
| 4.970259004777779 | 0.49 |
| 4.973318624222222 | 0.12 |
| 4.976392133361111 | 0.27 |
| 4.979452308388889 | 0.25 |
| 4.982514983555555 | 0.04 |
| 4.985574880805555 | 0.29 |
| 4.9886358892222225 | 0.52 |
| 4.991696619833333 | 0.32 |
| 4.994756794861111 | 0.39 |
| 4.997816136527778 | 0.58 |
| 5.0008763115555555 | 0.34 |
| 5.003937875555555 | 0.19 |
| 5.006997217194444 | 0.43 |
| 5.010057947833333 | 0.3 |
| 5.013125067694444 | 0.36 |
| 5.0161860761111114 | 0.48 |
| 5.019249029083333 | 0.26 |
| 5.022308926305556 | 0.47 |
| 5.025374379416666 | 0.43 |
| 5.028433721083333 | 0.29 |
| 5.031496674055556 | 0.43 |
| 5.0345562935 | 0.6 |
| 5.037621468805555 | 0.5 |
| 5.040681366055556 | 0.49 |
| 5.043740707694445 | 0.74 |
| 5.046800049361111 | 0.31 |
| 5.049860779972222 | 0.06 |
| 5.052920954999999 | 0.4 |
| 5.055986408111111 | 0.44 |
| 5.059052416805556 | 0.25 |
| 5.062116203166667 | 0.44 |
| 5.065176933777778 | 0.53 |
| 5.06823822 | 0.55 |
| 5.071298395027777 | 0.45 |
| 5.07435884786111 | 0.51 |
| 5.077421800805555 | 0.32 |
| 5.080485864972222 | 0.13 |
| 5.083547151166666 | 0.41 |
| 5.086607604 | 0.51 |
| 5.089668334611111 | 0.41 |
| 5.092728231861112 | 0.34 |
| 5.095788129083333 | 0.55 |
| 5.098853582194445 | 0.3 |
| 5.101917924138889 | 0.44 |
| 5.104978099166667 | 0.32 |
| 5.108039107583333 | 0.68 |
| 5.111099838194444 | 0.23 |
| 5.114168624833333 | 0.43 |
| 5.117234911333334 | 0.33 |
| 5.120294252972222 | 0.43 |
| 5.123368039888889 | 0.25 |
| 5.126427659333333 | 0.35 |
| 5.129490056722222 | 0.19 |
| 5.132549398388889 | 0.24 |
| 5.135613184722222 | 0.16 |
| 5.138675026527777 | 0.47 |
| 5.1417379795 | 0.26 |
| 5.144797598944444 | 0.44 |
| 5.147858329555556 | 0.35 |
| 5.150919337972223 | 0.67 |
| 5.153978957416666 | 0.35 |
| 5.157038021277778 | 0.28 |
| 5.160102085416667 | 0.14 |
| 5.1631722610277775 | 0.21 |
| 5.166231602666667 | 0.19 |
| 5.169291222111112 | 0.22 |
| 5.172351397138889 | 0.38 |
| 5.1754126833611105 | 0.31 |
| 5.178484247916666 | 0.33 |
| 5.181550256611112 | 0.32 |
| 5.184612376222223 | 0.38 |
| 5.187671717861112 | 0.59 |
| 5.1907313373055555 | -0.01 |
| 5.193790401166667 | 0.22 |
| 5.196854465305556 | 0.3 |
| 5.199921029583333 | 0.34 |
| 5.202983426972223 | 0.28 |
| 5.206043601999999 | 0.11 |
| 5.209104888222223 | 0.46 |
| 5.212165618833334 | 0.47 |
| 5.21523134975 | 0.5 |
| 5.218291246972222 | 0.21 |
| 5.221351699805556 | 0.42 |
| 5.224412430416667 | 0.58 |
| 5.2274720498611105 | 0.32 |
| 5.230532224888889 | 0.23 |
| 5.233592122138889 | 0.42 |
| 5.236652574972222 | 0.44 |
| 5.239729139833334 | 0.34 |
| 5.242792092777777 | 0.09 |
| 5.245856156944444 | 0.26 |
| 5.24892133225 | 0.14 |
| 5.251982062861111 | 0.31 |
| 5.2550433490833335 | 0.16 |
| 5.2581057464444445 | 0.51 |
| 5.2611650881111105 | 0.18 |
| 5.264232207972222 | 0.3 |
| 5.267292383027778 | 0.46 |
| 5.270352002472222 | 0.54 |
| 5.273412455277778 | 0.32 |
| 5.276471796944445 | 0.46 |
| 5.279531416388888 | 0.35 |
| 5.282592980388889 | 0.11 |
| 5.285662878194445 | 0.34 |
| 5.2887374985 | 0.43 |
| 5.291797951333334 | 0.13 |
| 5.294859515333333 | 0.48 |
| 5.297921912694444 | 0.48 |
| 5.300982643333334 | 0.37 |
| 5.304042540555555 | 0.24 |
| 5.307110216027778 | 0.17 |
| 5.310170946638889 | 0.26 |
| 5.313231955055555 | 0.29 |
| 5.316296297 | 0.42 |
| 5.319355360833333 | 0.5 |
| 5.322414702500001 | 0.2 |
| 5.325475433111111 | 0.31 |
| 5.328539219472223 | 0.29 |
| 5.331600783472222 | 0.46 |
| 5.334660125111111 | 0.09 |
| 5.337720855750001 | 0.41 |
| 5.34078241975 | 0.28 |
| 5.343845928305555 | 0.32 |
| 5.3469138815555555 | 0.47 |
| 5.349983223777778 | 0.32 |
| 5.353043398805555 | 0.29 |
| 5.356118019111111 | 0.23 |
| 5.35918208325 | 0.44 |
| 5.3622514254722216 | 0.49 |
| 5.365317434166666 | 0.51 |
| 5.3683826095 | 0.3 |
| 5.371441951138889 | 0.42 |
| 5.374501292777778 | 0.24 |
| 5.37756091225 | 0.44 |
| 5.380622198444445 | 0.49 |
| 5.383681817888888 | 0.45 |
| 5.386744770861111 | 0.29 |
| 5.389806612638889 | 0.25 |
| 5.392867343277778 | 0.56 |
| 5.3959286294722215 | 0.23 |
| 5.398990193472223 | 0.3 |
| 5.4020503685 | 0.38 |
| 5.4051119325 | 0.38 |
| 5.4081718297500005 | 0.38 |
| 5.411232560361111 | 0.25 |
| 5.414291902027777 | 0.52 |
| 5.41735179925 | 0.25 |
| 5.420412807666667 | 0.75 |
| 5.423479927555555 | 0.28 |
| 5.426540935944444 | 0.41 |
| 5.429603611138889 | 0.64 |
| 5.432663786166667 | 0.17 |
| 5.43572368338889 | 0.42 |
| 5.438785525194445 | 0.31 |
| 5.441847644777778 | 0.49 |
| 5.444908653194444 | 0.28 |
| 5.447969106027777 | 0.61 |
| 5.451029836638889 | 0.31 |
| 5.454091400638889 | 0.14 |
| 5.457155187000001 | 0.57 |
| 5.460214806444444 | 0.54 |
| 5.463274703666667 | 0.36 |
| 5.466335989888889 | 0.41 |
| 5.469395887111111 | 0.25 |
| 5.472467173888889 | 0.45 |
| 5.475529849083333 | 0.19 |
| 5.4785914130833335 | 0.37 |
| 5.481656032805556 | 0.34 |
| 5.4847167634166665 | 0.21 |
| 5.48777721625 | 0.33 |
| 5.490839891416667 | 0.34 |
| 5.493900622055556 | 0.6 |
| 5.496970797638889 | 0.6 |
| 5.500029861500001 | 0.38 |
| 5.503089480944444 | 0.41 |
| 5.5061552118611115 | 0.34 |
| 5.509222331722222 | 0.36 |
| 5.51229195175 | 0.3 |
| 5.5153551825 | 0.52 |
| 5.518416746500001 | 0.52 |
| 5.521483310805555 | 0.27 |
| 5.524543763611111 | 0.48 |
| 5.527603938638888 | 0.33 |
| 5.530663835888889 | 0.57 |
| 5.533725399888889 | 0.58 |
| 5.536785297138889 | 0.36 |
| 5.53985075025 | 0.14 |
| 5.5429153699722225 | 0.45 |
| 5.545983323222222 | 0.23 |
| 5.549049054138889 | 0.21 |
| 5.55211450725 | 0.39 |
| 5.555173848888889 | 0.35 |
| 5.558235690694444 | 0.39 |
| 5.561295587916667 | 0.43 |
| 5.5643568741388885 | 0.12 |
| 5.567421771666667 | 0.28 |
| 5.570481113305555 | 0.33 |
| 5.573541010555556 | 0.3 |
| 5.576600352194445 | 0.41 |
| 5.579659971638889 | 0.44 |
| 5.582720424472222 | 0.44 |
| 5.5857800439166665 | 0.34 |
| 5.588839385555556 | 0.11 |
| 5.591900116194444 | 0.32 |
| 5.594966402666667 | 0.56 |
| 5.598037411666667 | 0.27 |
| 5.601097308888889 | 0.48 |
| 5.604161650833333 | 0.67 |
| 5.607221270277778 | 0.34 |
| 5.610287834555556 | 0.37 |
| 5.613353009888889 | 0.26 |
| 5.616419851972222 | 0.48 |
| 5.619479193611111 | 0.26 |
| 5.622542702166666 | 0.37 |
| 5.625603710583333 | 0.17 |
| 5.628668885888889 | 0.35 |
| 5.631730449888889 | 0.39 |
| 5.634794514055556 | 0.57 |
| 5.637856911416667 | 0.16 |
| 5.6409165308611104 | 0.19 |
| 5.643975872527777 | 0.33 |
| 5.647052437388889 | 0.52 |
| 5.65011705711111 | 0.17 |
| 5.653176398749999 | 0.21 |
| 5.656240185111111 | 0.39 |
| 5.65929952675 | 0.32 |
| 5.662359424 | 0.54 |
| 5.665419876833333 | 0.5 |
| 5.668488107888888 | 0.62 |
| 5.671548005111111 | 0.67 |
| 5.6746106802777785 | 0.18 |
| 5.677672244277778 | 0.43 |
| 5.680731585944445 | 0.33 |
| 5.683796483472222 | 0.45 |
| 5.686858325249999 | 0.2 |
| 5.6899182225 | 0.36 |
| 5.6929775641388884 | 0.53 |
| 5.696037461388889 | 0.35 |
| 5.6990979142222224 | 0.44 |
| 5.702159756 | 0.59 |
| 5.705221875583333 | 0.4 |
| 5.708282328416667 | 0.18 |
| 5.711351392861111 | 0.46 |
| 5.7144112900833335 | 0.36 |
| 5.7174722985 | 0.38 |
| 5.720531640138889 | 0.37 |
| 5.723597926638889 | 0.27 |
| 5.726657268305556 | 0.3 |
| 5.7297174433333335 | 0.54 |
| 5.732777896138889 | 0.55 |
| 5.7358427936666665 | 0.61 |
| 5.7389110247222215 | 0.44 |
| 5.741970921972222 | 0.52 |
| 5.745031097 | 0.45 |
| 5.7481026615555555 | 0.37 |
| 5.751162003222222 | 0.51 |
| 5.754223844999999 | 0.36 |
| 5.7572865201944445 | 0.4 |
| 5.760346973 | 0.56 |
| 5.763406314666667 | 0.2 |
| 5.766470101 | 0.37 |
| 5.769530831638889 | 0.36 |
| 5.772593784611112 | 0.38 |
| 5.775661460055555 | 0.5 |
| 5.778723579638888 | 0.34 |
| 5.781783199083334 | 0.43 |
| 5.784851152361111 | 0.31 |
| 5.787911049583333 | 0.29 |
| 5.790970669027778 | 0.25 |
| 5.794030010694445 | 0.19 |
| 5.797092408055556 | 0.51 |
| 5.800152305305556 | 0.33 |
| 5.803216091666666 | 0.37 |
| 5.806275433305555 | 0.26 |
| 5.8093367195 | 0.21 |
| 5.812402172611112 | 0.12 |
| 5.815463736611111 | 0.58 |
| 5.818524745027778 | 0.12 |
| 5.821590475944444 | 0.3 |
| 5.824649539805556 | 0.44 |
| 5.827711937166667 | 0.48 |
| 5.830772945583334 | 0.51 |
| 5.833833953999999 | 0.29 |
| 5.836895240222223 | 0.3 |
| 5.8399554152499995 | 0.39 |
| 5.843014756888889 | 0.37 |
| 5.846076320888889 | 0.5 |
| 5.849135384749999 | 0.47 |
| 5.852196670972223 | 0.51 |
| 5.85527823611111 | 0.21 |
| 5.8583895251666664 | 0.47 |
| 5.861494424972221 | 0.57 |
| 5.865041572305556 | 0.11 |
| 5.868103691888889 | 0.12 |
| 5.871199146722223 | 0.37 |
| 5.8742645998333325 | 0.55 |
| 5.877326441638889 | 0.53 |
| 5.880390505777777 | 0.33 |
| 5.883451236388889 | 0.36 |
| 5.886515300527778 | 0.53 |
| 5.889579920277777 | 0.35 |
| 5.892641206472222 | 0.31 |
| 5.895702492694444 | 0.38 |
| 5.898774057250001 | 0.39 |
| 5.901842566111111 | 0.5 |
| 5.904904130111111 | 0.3 |
| 5.907971249972222 | 0.19 |
| 5.911033091777778 | 0.26 |
| 5.914097155916667 | 0.13 |
| 5.917157886527778 | 0.26 |
| 5.920250007833333 | 0.4 |
| 5.923311294027777 | 0.44 |
| 5.926372580250001 | 0.54 |
| 5.929435255416666 | 0.49 |
| 5.932495152666667 | 0.3 |
| 5.935556161083333 | 0.44 |
| 5.938646893416666 | 0.24 |
| 5.9417173468055555 | 0.28 |
| 5.944780021972222 | 0.27 |
| 5.9478396414166665 | 0.49 |
| 5.950902872194445 | 0.53 |
| 5.953968880888889 | 0.32 |
| 5.957035167388889 | 0.34 |
| 5.960096453583334 | 0.44 |
| 5.963157462 | 0.28 |
| 5.966216803638889 | 0.65 |
| 5.9692775342777775 | 0.16 |
| 5.972344098555556 | 0.42 |
| 5.975404829166667 | 0.17 |
| 5.978468337722222 | 0.45 |
| 5.981530179527778 | 0.3 |
| 5.984600632916667 | 0.61 |
| 5.987664697055555 | 0.6 |
| 5.990725149888888 | 0.5 |
| 5.993791714166667 | 0.4 |
| 5.996862723166667 | 0.39 |
| 5.999927342888888 | 0.38 |
| 6.00298640675 | 0.3 |
| 6.006046859583333 | 0.37 |
| 6.009110923722222 | 0.45 |
| 6.012194988999999 | 0.27 |
| 6.015262942250001 | 0.39 |
| 6.018324784055555 | 0.47 |
| 6.0213857924722225 | 0.22 |
| 6.024445689694445 | 0.13 |
| 6.027506142527778 | 0.35 |
| 6.030568539916667 | 0.21 |
| 6.0336303816944445 | 0.49 |
| 6.036690001138889 | 0.13 |
| 6.039751009555555 | 0.33 |
| 6.042836463833333 | 0.32 |
| 6.045907472805555 | 0.37 |
| 6.048974037083333 | 0.36 |
| 6.05203337875 | 0.2 |
| 6.055093275972222 | 0.19 |
| 6.058152895416667 | 0.25 |
| 6.061213070472222 | 0.48 |
| 6.064274078861112 | 0.49 |
| 6.067334253916667 | 0.53 |
| 6.070394151138889 | 0.2 |
| 6.073453215 | 0.59 |
| 6.076517834722222 | 0.23 |
| 6.079578565361111 | 0.4 |
| 6.082640684944445 | 0.24 |
| 6.085706138055556 | 0.24 |
| 6.088771035583333 | 0.4 |
| 6.091831766194445 | 0.51 |
| 6.094896663722222 | 0.44 |
| 6.097961005666667 | 0.23 |
| 6.101028125527778 | 0.24 |
| 6.104091356277777 | 0.43 |
| 6.107150697944445 | 0.36 |
| 6.110214484277778 | 0.44 |
| 6.113276881666666 | 0.4 |
| 6.1163428903611115 | 0.22 |
| 6.119403898777778 | 0.45 |
| 6.122511020944445 | 0.4 |
| 6.12558341888889 | 0.31 |
| 6.128643871722223 | 0.24 |
| 6.13170404675 | 0.32 |
| 6.1347767225 | 0.21 |
| 6.137839953277778 | 0.31 |
| 6.140899294916666 | 0.33 |
| 6.143959192166667 | 0.34 |
| 6.147031034527778 | 0.41 |
| 6.150090376166666 | 0.7 |
| 6.153151384583333 | 0.59 |
| 6.156232671944444 | 0.66 |
| 6.159293402555556 | 0.34 |
| 6.1623566333055555 | 0.36 |
| 6.165418752916667 | 0.19 |
| 6.168479205722222 | 0.38 |
| 6.1715388251666665 | 0.42 |
| 6.174599000194444 | 0.26 |
| 6.1776655645 | 0.23 |
| 6.180726572916667 | 0.36 |
| 6.183788970277778 | 0.48 |
| 6.186851089888889 | 0.64 |
| 6.189911542694444 | 0.57 |
| 6.192972273333334 | 0.34 |
| 6.196037448638889 | 0.16 |
| 6.199097623666667 | 0.4 |
| 6.202160854444444 | 0.22 |
| 6.205223529611111 | 0.51 |
| 6.208287593750001 | 0.66 |
| 6.211349435555555 | 0.46 |
| 6.214413221888889 | 0.37 |
| 6.217477841638889 | 0.45 |
| 6.220548572805556 | 0.4 |
| 6.223623193111111 | 0.23 |
| 6.226683368138889 | 0.62 |
| 6.229745209944444 | 0.42 |
| 6.232851498722223 | 0.47 |
| 6.235925007861111 | 0.31 |
| 6.239037130305556 | 0.4 |
| 6.242104250166667 | 0.35 |
| 6.245166091972223 | 0.38 |
| 6.248225433611111 | 0.46 |
| 6.251285886444445 | 0.29 |
| 6.2543468948611105 | 0.02 |
| 6.257411236805556 | 0.45 |
| 6.260473634166667 | 0.54 |
| 6.2635426986111105 | 0.32 |
| 6.266602595833334 | 0.3 |
| 6.269662215277777 | 0.28 |
| 6.272726557222223 | 0.41 |
| 6.275786454472222 | 0.3 |
| 6.278846907277778 | 0.55 |
| 6.281907915694444 | 0.54 |
| 6.2849753133611115 | 0.43 |
| 6.288035488416667 | 0.33 |
| 6.2910951078611115 | 0.5 |
| 6.294157227444445 | 0.41 |
| 6.29721768025 | 0.38 |
| 6.300277855305556 | 0.13 |
| 6.30334080825 | 0.33 |
| 6.306401261083333 | 0.21 |
| 6.309463658472222 | 0.25 |
| 6.3125266114444445 | 0.17 |
| 6.315586230888888 | 0.52 |
| 6.3186541841388895 | 0.24 |
| 6.321715470333333 | 0.38 |
| 6.32477647875 | 0.24 |
| 6.327839153944444 | 0.31 |
| 6.330920996861111 | 0.02 |
| 6.333980338527778 | 0.23 |
| 6.3370446804444445 | 0.18 |
| 6.340107911222223 | 0.2 |
| 6.343172253166666 | 0.17 |
| 6.346233817166667 | 0.42 |
| 6.3492951033611105 | 0.14 |
| 6.352355833972222 | 0.25 |
| 6.355422398277778 | 0.52 |
| 6.358483128888889 | 0.11 |
| 6.36154691525 | 0.32 |
| 6.364615701861111 | 0.4 |
| 6.367679766027778 | 0.44 |
| 6.37075633088889 | 0.01 |
| 6.373816783694445 | 0.36 |
| 6.376878903277778 | 0.45 |
| 6.379942689638889 | 0.25 |
| 6.383006753777777 | 0.17 |
| 6.3860663732222225 | 0.06 |
| 6.389140715722222 | 0.42 |
| 6.392206168861111 | -0.04 |
| 6.395265788305556 | 0.18 |
| 6.398325963333334 | 0.3 |
| 6.401385582777778 | 0.45 |
| 6.404447424555555 | 0.29 |
| 6.407507321805555 | 0.37 |
| 6.4105672190277785 | 0.33 |
| 6.413627394083334 | 0.07 |
| 6.416687291305555 | 0.32 |
| 6.419748299722222 | 0.32 |
| 6.422807919166667 | 0.38 |
| 6.425871427722223 | 0.37 |
| 6.4289310471666665 | 0.34 |
| 6.431995389111111 | 0.25 |
| 6.435057786500001 | 0.3 |
| 6.438122961805556 | 0.45 |
| 6.441184525805555 | 0.38 |
| 6.444254145833333 | 0.29 |
| 6.447337655527778 | 0.24 |
| 6.450399775111111 | 0.43 |
| 6.453461894694445 | 0.29 |
| 6.4565237365 | 0.28 |
| 6.459588634027778 | 0.42 |
| 6.462649920222223 | 0.1 |
| 6.465716762305556 | 0.29 |
| 6.468777215138889 | 0.4 |
| 6.471840723694444 | 0.28 |
| 6.474900065333333 | 0.2 |
| 6.477963296083333 | 0.42 |
| 6.481023193333334 | 0.53 |
| 6.484083368361111 | 0.32 |
| 6.487142987805555 | 0.21 |
| 6.490203996222222 | 0.4 |
| 6.493274171833334 | 0.37 |
| 6.496333235694444 | 0.34 |
| 6.499392577333333 | 0.3 |
| 6.502461363972222 | 0.22 |
| 6.505521261222222 | 0.49 |
| 6.508588103277778 | 0.33 |
| 6.511661334638889 | 0.38 |
| 6.514743177555556 | 0.45 |
| 6.517803630388889 | 0.49 |
| 6.520866305555555 | 0.22 |
| 6.523927036194444 | 0.23 |
| 6.526989433555555 | 0.55 |
| 6.530049053000001 | 0.31 |
| 6.53311283936111 | 0.44 |
| 6.536183848333334 | 0.56 |
| 6.539244856750001 | 0.35 |
| 6.542305031777778 | 0.4 |
| 6.545371318277778 | 0.12 |
| 6.548431493305555 | 0.43 |
| 6.551503057888889 | 0.46 |
| 6.554564066305556 | 0.4 |
| 6.557626463666667 | 0.47 |
| 6.560686360916666 | 0.32 |
| 6.56374681375 | 0.54 |
| 6.566807266583333 | 0.41 |
| 6.5698704973333335 | 0.42 |
| 6.572933172500001 | 0.27 |
| 6.575999181194445 | 0.29 |
| 6.5790632453611115 | 0.51 |
| 6.582123142583333 | 0.55 |
| 6.585187206722222 | 0.62 |
| 6.5882521042499995 | 0.35 |
| 6.591318112944444 | 0.56 |
| 6.594378288 | 0.44 |
| 6.597453463888889 | 0.34 |
| 6.600513083333333 | 0.32 |
| 6.603574369527778 | 0.13 |
| 6.606635100138889 | 0.46 |
| 6.609694997388889 | 0.29 |
| 6.612760728277777 | 0.36 |
| 6.615821181111111 | 0.25 |
| 6.618883856305556 | 0.6 |
| 6.621958476583334 | 0.6 |
| 6.62501781825 | 0.26 |
| 6.628077715472222 | 0.19 |
| 6.631140390666667 | 0.45 |
| 6.634206399361111 | 0.3 |
| 6.6372679633611105 | 0.44 |
| 6.640328416194444 | 0.16 |
| 6.643387757833333 | 0.21 |
| 6.646463211527778 | 0.51 |
| 6.649526442277778 | 0.49 |
| 6.652586061722222 | 0.27 |
| 6.655645403388888 | 0.39 |
| 6.658709745305555 | 0.37 |
| 6.661772142694445 | 0.49 |
| 6.66485315225 | 0.4 |
| 6.667913882861111 | 0.5 |
| 6.670974057916666 | 0.42 |
| 6.674033399555555 | 0.52 |
| 6.677093296805555 | 0.6 |
| 6.680153194027778 | 0.41 |
| 6.683216980388889 | 0.23 |
| 6.686281044527777 | 0.59 |
| 6.68934094175 | 0.31 |
| 6.692408061638889 | 0.64 |
| 6.695478237250001 | 0.42 |
| 6.698538967861111 | 0.7 |
| 6.701601643027778 | 0.23 |
| 6.704662651444445 | 0.43 |
| 6.707726715583334 | 0.44 |
| 6.710788001805556 | 0.16 |
| 6.713850399166667 | 0.43 |
| 6.716910574222222 | 0.43 |
| 6.719971860416667 | 0.46 |
| 6.723032868833333 | 0.3 |
| 6.726093043861112 | 0.04 |
| 6.729157108000001 | 0.23 |
| 6.73222089436111 | 0.22 |
| 6.7352807915833335 | 0.35 |
| 6.738342355583333 | 0.15 |
| 6.741402808416666 | 0.53 |
| 6.744462150083334 | 0.45 |
| 6.747542881833333 | 0.29 |
| 6.750602501277778 | 0.39 |
| 6.753665732027778 | 0.32 |
| 6.756728685000001 | 0.03 |
| 6.759788304444444 | 0.63 |
| 6.762853201972223 | 0.4 |
| 6.765915599361111 | 0.24 |
| 6.7689779967499994 | 0.66 |
| 6.77203956075 | 0.08 |
| 6.775101958111111 | 0.14 |
| 6.77816268875 | 0.33 |
| 6.781222030388889 | 0.36 |
| 6.7842830388055555 | 0.42 |
| 6.787345158388889 | 0.2 |
| 6.7904058890000005 | 0.43 |
| 6.7934652306666665 | 0.14 |
| 6.796539017583333 | 0.13 |
| 6.799599192611111 | 0.55 |
| 6.8026610344166665 | 0.21 |
| 6.805720653861111 | 0.56 |
| 6.808781384472223 | 0.29 |
| 6.8118421150833335 | 0.41 |
| 6.814904512472222 | 0.39 |
| 6.8179677432500005 | 0.38 |
| 6.821030418416667 | 0.36 |
| 6.824098649472223 | 0.51 |
| 6.8271588245 | 0.55 |
| 6.830218999527777 | 0.36 |
| 6.833282785888889 | 0.42 |
| 6.836342127527778 | 0.26 |
| 6.839407580638889 | 0.37 |
| 6.8424680334722225 | 0.38 |
| 6.8455309864444445 | 0.21 |
| 6.848601717611111 | 0.29 |
| 6.8516621704444445 | 0.48 |
| 6.854721512111111 | 0.44 |
| 6.857782242722223 | 0.01 |
| 6.860841306583334 | 0.44 |
| 6.863901203805556 | 0.3 |
| 6.866963045611111 | 0.48 |
| 6.870023220638888 | 0.55 |
| 6.873090618305556 | 0.42 |
| 6.876156071416666 | 0.47 |
| 6.879224858055556 | 0.63 |
| 6.8822858664722215 | 0.36 |
| 6.885351041777779 | 0.31 |
| 6.888411494611112 | 0.46 |
| 6.891476947722222 | 0.35 |
| 6.894538511722223 | 0.45 |
| 6.897598131166667 | 0.45 |
| 6.900658861777777 | 0.48 |
| 6.903718203444444 | 0.54 |
| 6.906777267305555 | 0.59 |
| 6.90983688675 | 0.42 |
| 6.912898172944444 | 0.72 |
| 6.915969737527778 | 0.24 |
| 6.919031023722223 | 0.28 |
| 6.9220942545 | 0.3 |
| 6.925154429527778 | 0.44 |
| 6.92821432675 | 0.19 |
| 6.931273668416666 | 0.4 |
| 6.934339954916667 | 0.35 |
| 6.937402630083333 | 0.21 |
| 6.940463082916666 | 0.3 |
| 6.943523257944444 | 0.19 |
| 6.9465914889722225 | -0.06 |
| 6.949660275611111 | 0.16 |
| 6.952726562111111 | 0.27 |
| 6.9557889595 | 0.33 |
| 6.958848578944444 | 0.27 |
| 6.961911254111111 | -0.13 |
| 6.964970873555556 | 0.25 |
| 6.968030770805555 | 0.25 |
| 6.971093168166666 | 0.42 |
| 6.974153898805556 | 0.41 |
| 6.977217129555555 | 0.38 |
| 6.980293416638888 | 0.22 |
| 6.983355536222222 | 0.49 |
| 6.9864184891944445 | 0.28 |
| 6.989481719944444 | 0.37 |
| 6.992548562027777 | 0.29 |
| 6.9956095704444445 | 0.27 |
| 6.998674467972222 | 0.45 |
| 7.001735754166667 | 0.45 |
| 7.004795651416667 | 0.35 |
| 7.007856104222222 | 0.22 |
| 7.010915723666667 | 0.35 |
| 7.0139770098888885 | 0.46 |
| 7.0170377405 | 0.32 |
| 7.020097082166667 | 0.36 |
| 7.023158646166666 | 0.37 |
| 7.026218265611112 | 0.29 |
| 7.029280107388889 | 0.15 |
| 7.03235194975 | 0.48 |
| 7.0354137915555555 | 0.15 |
| 7.038474244388889 | 0.29 |
| 7.041533308222222 | 0.4 |
| 7.044593483277778 | 0.28 |
| 7.047654491666667 | 0.64 |
| 7.0507149445 | 0.05 |
| 7.053776786305556 | 0.34 |
| 7.0568452951388885 | 0.29 |
| 7.059907136944444 | 0.3 |
| 7.062970367694445 | 0.32 |
| 7.066033876250001 | 0.29 |
| 7.069097384805556 | 0.26 |
| 7.072158115416666 | 0.39 |
| 7.075225235305556 | 0.07 |
| 7.078286243722222 | 0.26 |
| 7.081354196972223 | 0.2 |
| 7.084413260833334 | 0.34 |
| 7.0874731580555554 | 0.55 |
| 7.090533610888889 | 0.6 |
| 7.093599619583333 | 0.35 |
| 7.096659239027778 | 0.28 |
| 7.099723025388888 | 0.41 |
| 7.102785422777778 | 0.59 |
| 7.105849209111111 | 0.16 |
| 7.108909384138888 | 0.46 |
| 7.111968725805555 | 0.48 |
| 7.115028900833333 | 0.21 |
| 7.11808990925 | 0.43 |
| 7.121151473249999 | 0.42 |
| 7.1242113704722225 | 0.29 |
| 7.127271545527778 | 0.47 |
| 7.130364500194444 | 0.5 |
| 7.133429953305555 | 0.27 |
| 7.136489294972222 | 0.34 |
| 7.139550581166667 | 0.44 |
| 7.142609645027778 | 0.49 |
| 7.145669542277778 | 0.63 |
| 7.148738606694445 | 0.31 |
| 7.151804337611111 | 0.4 |
| 7.15486367925 | 0.58 |
| 7.157925243249999 | 0.37 |
| 7.160988474 | 0.23 |
| 7.164048093444444 | 0.45 |
| 7.16710993525 | 0.55 |
| 7.1701737216111106 | 0.49 |
| 7.173233896638889 | 0.5 |
| 7.1762960162222225 | 0.33 |
| 7.179359802583334 | 0.41 |
| 7.182421088777778 | 0.39 |
| 7.185483763944444 | 0.78 |
| 7.1885469947222225 | 0.04 |
| 7.191608280916667 | 0.3 |
| 7.194668178166666 | 0.39 |
| 7.197730575527777 | 0.35 |
| 7.200790750583333 | 0.27 |
| 7.203851759 | 0.42 |
| 7.206913878583333 | 0.15 |
| 7.209975164777777 | 0.56 |
| 7.21303561761111 | 0.25 |
| 7.216099403944445 | 0.44 |
| 7.2191590233888885 | 0.29 |
| 7.222219754027778 | 0.41 |
| 7.225279373472222 | 0.4 |
| 7.228342604222222 | 0.48 |
| 7.231405001611112 | 0.3 |
| 7.234464621055555 | 0.6 |
| 7.237526462833334 | 0.62 |
| 7.24058747125 | 0.57 |
| 7.243647924083334 | 0.35 |
| 7.246710043666666 | 0.46 |
| 7.249771052083333 | 0.35 |
| 7.252834560638889 | 0.45 |
| 7.255898902583334 | 0.23 |
| 7.258959911 | 0.14 |
| 7.262021197194445 | 0.57 |
| 7.265093595138889 | 0.46 |
| 7.2681529368055555 | 0.42 |
| 7.27121255625 | 0.31 |
| 7.2742724535 | 0.23 |
| 7.277331795138889 | 0.41 |
| 7.280392247972222 | 0.29 |
| 7.28345408975 | 0.3 |
| 7.286513431416667 | 0.59 |
| 7.289575551 | 0.5 |
| 7.29263878175 | 0.26 |
| 7.295698401194445 | 0.45 |
| 7.298763298722222 | 0.34 |
| 7.301828474055555 | 0.32 |
| 7.304888926861111 | 0.31 |
| 7.3079488241111115 | 0.44 |
| 7.311008999138889 | 0.71 |
| 7.314068340805556 | 0.03 |
| 7.317128515833334 | 0.23 |
| 7.320188968638889 | 0.24 |
| 7.3232496992777785 | 0.35 |
| 7.3263115410555555 | 0.43 |
| 7.329372271694445 | 0.6 |
| 7.332432168916666 | 0.29 |
| 7.335492899527778 | 0.36 |
| 7.338556963694445 | 0.33 |
| 7.341616860916666 | 0.34 |
| 7.344678424916667 | 0.42 |
| 7.347741100083333 | 0.24 |
| 7.350805997611111 | 0.45 |
| 7.353865894861111 | 0.09 |
| 7.3569605163055565 | 0.28 |
| 7.360022635888889 | 0.33 |
| 7.363090033555555 | 0.4 |
| 7.366150208583333 | 0.35 |
| 7.3692151061111115 | 0.22 |
| 7.372274725555555 | 0.29 |
| 7.375339067500001 | 0.54 |
| 7.378400909305555 | 0.25 |
| 7.381478029749999 | 0.17 |
| 7.384538482555556 | 0.36 |
| 7.3876019911111115 | 0.34 |
| 7.390661610555555 | 0.34 |
| 7.393723174555555 | 0.38 |
| 7.396782794 | 0.24 |
| 7.399852969611111 | 0.17 |
| 7.402914255833334 | 0.37 |
| 7.405976931 | 0.5 |
| 7.409036272638889 | 0.45 |
| 7.4121017257499995 | 0.23 |
| 7.415162456388889 | 0.56 |
| 7.418224575972222 | 0.58 |
| 7.421286973333333 | 0.65 |
| 7.424346592805556 | 0.29 |
| 7.427405934444445 | 0.27 |
| 7.430468054027777 | 0.3 |
| 7.433529062444444 | 0.32 |
| 7.43659090425 | 0.38 |
| 7.439651079277778 | 0.49 |
| 7.442712643277778 | 0.25 |
| 7.445785041222222 | 0.45 |
| 7.448844938472222 | 0.49 |
| 7.451907613638888 | 0.19 |
| 7.454967788666666 | 0.32 |
| 7.458027408111111 | 0.52 |
| 7.461088972111111 | 0.43 |
| 7.464150536111111 | 0.47 |
| 7.467216544805555 | 0.64 |
| 7.470277275444444 | 0.25 |
| 7.473339395027778 | 0.44 |
| 7.476402625777778 | 0.4 |
| 7.479461967444444 | 0.4 |
| 7.4825235314444445 | 0.13 |
| 7.485582873083333 | 0.48 |
| 7.488648326194444 | 0.5 |
| 7.491711834749999 | 0.13 |
| 7.4947728431666665 | 0.64 |
| 7.497836073916666 | 0.47 |
| 7.500897915722223 | 0.39 |
| 7.503958368555556 | 0.46 |
| 7.507019932555556 | 0.48 |
| 7.510079274194444 | 0.37 |
| 7.513138893638889 | 0.48 |
| 7.516199346472222 | 0.43 |
| 7.519262299444445 | 0.51 |
| 7.522322196666666 | 0.43 |
| 7.5253818161111115 | 0.26 |
| 7.528441157777778 | 0.44 |
| 7.5315057775 | 0.52 |
| 7.534569008277778 | 0.49 |
| 7.537628627722222 | 0.33 |
| 7.540688247166666 | 0.61 |
| 7.543748144388889 | 0.36 |
| 7.546808041638888 | 0.28 |
| 7.549869883416667 | 0.2 |
| 7.552935892111111 | 0.37 |
| 7.55599662275 | 0.35 |
| 7.559061798055556 | 0.37 |
| 7.5621211397222226 | 0.39 |
| 7.565182148111111 | 0.6 |
| 7.568245378888889 | 0.32 |
| 7.571308609638889 | 0.47 |
| 7.574367951305556 | 0.43 |
| 7.577431182055555 | 0.28 |
| 7.58049469061111 | 0.63 |
| 7.583554865638889 | 0.24 |
| 7.586615040694444 | 0.24 |
| 7.589689660972222 | 0.42 |
| 7.592750113805556 | 0.47 |
| 7.5958108444166665 | 0.21 |
| 7.59887601975 | 0.32 |
| 7.601935639194445 | 0.47 |
| 7.604996092027778 | 0.21 |
| 7.608057100444444 | 0.36 |
| 7.611117831055555 | 0.04 |
| 7.614180784027778 | 0.38 |
| 7.617240403472222 | 0.4 |
| 7.620305300999999 | 0.26 |
| 7.623367976166667 | 0.36 |
| 7.626427873388889 | 0.23 |
| 7.629494715472222 | 0.34 |
| 7.632559613 | 0.12 |
| 7.635623399361111 | 0.1 |
| 7.638684129972223 | 0.26 |
| 7.641745138388888 | 0.31 |
| 7.644810313694445 | 0.51 |
| 7.6478718776944445 | 0.22 |
| 7.65093205275 | 0.36 |
| 7.654001117166667 | 0.41 |
| 7.657070459388889 | 0.16 |
| 7.660130912222222 | 0.24 |
| 7.663196087527777 | 0.18 |
| 7.666255984777778 | 0.42 |
| 7.66931893775 | 0.46 |
| 7.672378279388889 | 0.36 |
| 7.675437621055556 | 0.2 |
| 7.678497518277777 | 0.4 |
| 7.6815607490555555 | 0.14 |
| 7.684620646277778 | 0.42 |
| 7.687679987944445 | 0.27 |
| 7.690739885166667 | 0.17 |
| 7.693799782416666 | 0.48 |
| 7.696862457583333 | 0.36 |
| 7.699930410833333 | 0.6 |
| 7.702990030277777 | 0.29 |
| 7.7060510386944445 | 0.05 |
| 7.709114269472222 | 0.49 |
| 7.712181944916667 | 0.34 |
| 7.715242397750001 | 0.28 |
| 7.718304239527778 | 0.27 |
| 7.721364136777778 | 0.41 |
| 7.724431256666667 | 0.56 |
| 7.727495598583333 | 0.38 |
| 7.730554662444445 | 0.74 |
| 7.733619004388888 | 0.4 |
| 7.736681679555556 | 0.39 |
| 7.739745743694445 | 0.38 |
| 7.742806474333333 | 0.27 |
| 7.745866371555556 | 0.43 |
| 7.748929046722223 | 0.4 |
| 7.751988388388889 | 0.23 |
| 7.755047730027778 | 0.32 |
| 7.7581137387500005 | 0.38 |
| 7.76117863625 | 0.14 |
| 7.76426714625 | 0.26 |
| 7.767328432444445 | 0.32 |
| 7.770388885277778 | 0.24 |
| 7.773449893694444 | 0.6 |
| 7.776513957833333 | 0.2 |
| 7.779575799638889 | 0.14 |
| 7.782636252444445 | 0.22 |
| 7.785696983083333 | 0.22 |
| 7.78875965825 | 0.4 |
| 7.791822889 | 0.49 |
| 7.794883341833333 | 0.55 |
| 7.797944628055555 | 0.09 |
| 7.80100591425 | 0.56 |
| 7.804066367083334 | 0.17 |
| 7.807130431222222 | 0.19 |
| 7.810191161833333 | 0.19 |
| 7.813256059361112 | 0.14 |
| 7.816322068055555 | 0.25 |
| 7.819382798694445 | 0.37 |
| 7.822444640472222 | 0.37 |
| 7.825507315638889 | 0.66 |
| 7.828567212888888 | 0.72 |
| 7.8316265545277775 | 0.38 |
| 7.8346958967499996 | 0.65 |
| 7.837755516194444 | 0.37 |
| 7.840815969027778 | 0.21 |
| 7.843875310694445 | 0.59 |
| 7.846936596888889 | 0.4 |
| 7.849999272055555 | 0.23 |
| 7.853064447388888 | 0.16 |
| 7.8561243446111115 | 0.45 |
| 7.8591836862777775 | 0.23 |
| 7.862247472611111 | 0.43 |
| 7.865310981166666 | 0.54 |
| 7.8683753231111115 | 0.57 |
| 7.871438276083333 | 0.46 |
| 7.874497895527778 | 0.28 |
| 7.877556959388889 | 0.54 |
| 7.880625468222222 | 0.48 |
| 7.883685365472222 | 0.33 |
| 7.886750540777777 | 0.25 |
| 7.889848773555556 | 0.27 |
| 7.892909781972222 | 0.43 |
| 7.895974123888889 | 0.4 |
| 7.899037632444444 | 0.25 |
| 7.9020978075 | 0.52 |
| 7.905157149138889 | 0.44 |
| 7.908219268722222 | 0.54 |
| 7.911279165972222 | 0.34 |
| 7.914353786277777 | 0.17 |
| 7.917414794666667 | 0.16 |
| 7.920474969722222 | 0.26 |
| 7.923553479138889 | 0.01 |
| 7.926625599277778 | 0.27 |
| 7.929690496805556 | 0.23 |
| 7.932769006222222 | 0.35 |
| 7.935828903472222 | 0.5 |
| 7.938890467472222 | 0.44 |
| 7.941953698222222 | 0.36 |
| 7.945014706638888 | 0.15 |
| 7.948084604444445 | 0.36 |
| 7.951148946388889 | 0.15 |
| 7.954216621833334 | 0.1 |
| 7.9572809637777775 | 0.37 |
| 7.960340027638889 | 0.56 |
| 7.963402980611112 | 0.17 |
| 7.9664637112222225 | 0.32 |
| 7.969524719638889 | 0.38 |
| 7.9726101738888895 | 0.32 |
| 7.975673404666667 | 0.42 |
| 7.978733857472222 | 0.14 |
| 7.981794865888889 | 0.44 |
| 7.984856707694445 | 0.39 |
| 7.98792021625 | 0.47 |
| 7.990984558194444 | 0.48 |
| 7.994045011000001 | 0.32 |
| 7.997111019722222 | 0.33 |
| 8.000172583722222 | 0.31 |
| 8.003232480944444 | 0.41 |
| 8.006292378194445 | 0.33 |
| 8.009358109083333 | 0.41 |
| 8.01241828411111 | 0.39 |
| 8.015482626055556 | 0.22 |
| 8.01854780138889 | 0.11 |
| 8.02161019875 | 0.43 |
| 8.02467231836111 | 0.41 |
| 8.02773166 | 0.28 |
| 8.030807113694445 | 0.36 |
| 8.033866455333333 | 0.21 |
| 8.036930241694444 | 0.51 |
| 8.039990416722222 | 0.46 |
| 8.043063925833334 | 0.46 |
| 8.046123545277778 | 0.44 |
| 8.049185942666666 | 0.29 |
| 8.052253340333333 | 0.31 |
| 8.055313237583333 | 0.56 |
| 8.058374246 | 0.09 |
| 8.061436365583333 | 0.35 |
| 8.064497651777778 | 0.49 |
| 8.067558382388889 | 0.21 |
| 8.070627446833333 | 0.29 |
| 8.073695677888889 | 0.5 |
| 8.076759742027777 | 0.32 |
| 8.079827417472222 | 0.45 |
| 8.082888981472223 | 0.32 |
| 8.085961935027777 | 0.36 |
| 8.089026554750001 | 0.37 |
| 8.092085896416666 | 0.42 |
| 8.095147182611111 | 0.21 |
| 8.09820958 | 0.28 |
| 8.101268921638889 | 0.49 |
| 8.10432881888889 | 0.69 |
| 8.107392605222222 | 0.38 |
| 8.110452502472222 | 0.28 |
| 8.113515733222222 | 0.7 |
| 8.116575908277778 | 0.22 |
| 8.119643028138888 | 0.34 |
| 8.122710148 | 0.36 |
| 8.125770878638889 | 0.47 |
| 8.12883244263889 | 0.31 |
| 8.131893451055555 | 0.2 |
| 8.134952792694444 | 0.25 |
| 8.138012689944444 | 0.26 |
| 8.141073420555555 | 0.16 |
| 8.14413304 | 0.28 |
| 8.147195159583333 | 0.46 |
| 8.15025450125 | 0.64 |
| 8.153318009805556 | 0.23 |
| 8.156385407472222 | 0.24 |
| 8.159446138083332 | 0.28 |
| 8.16250631311111 | 0.34 |
| 8.16556565475 | 0.26 |
| 8.168624996416666 | 0.11 |
| 8.171685171444445 | 0.52 |
| 8.174750902361112 | 0.26 |
| 8.177815799888888 | 0.26 |
| 8.180885975472222 | 0.43 |
| 8.183948928444444 | 0.62 |
| 8.187011603611111 | 0.33 |
| 8.190073445416667 | 0.73 |
| 8.193138898527778 | 0.2 |
| 8.196201573694443 | 0.17 |
| 8.199261470944444 | 0.41 |
| 8.202323034944444 | 0.44 |
| 8.205395432888889 | 0.26 |
| 8.208458108083333 | 0.16 |
| 8.211517171916666 | 0.45 |
| 8.21457845813889 | 0.22 |
| 8.217637522 | 0.27 |
| 8.220697419222223 | 0.46 |
| 8.223762038972222 | 0.28 |
| 8.226822491777778 | 0.4 |
| 8.229889889444443 | 0.46 |
| 8.2329581205 | 0.39 |
| 8.236021073472223 | 0.12 |
| 8.239080970722222 | 0.38 |
| 8.242140867944444 | 0.4 |
| 8.245200487388889 | 0.16 |
| 8.248261218 | -0.01 |
| 8.25133000463889 | 0.36 |
| 8.254394624388889 | 0.24 |
| 8.257457577361112 | 0.14 |
| 8.260520252527778 | 0.31 |
| 8.263583761083334 | 0.45 |
| 8.266645325083333 | 0.12 |
| 8.269710778194444 | 0.32 |
| 8.272771786611111 | 0.3 |
| 8.275833906194444 | 0.36 |
| 8.278893525638889 | 0.2 |
| 8.281952867277777 | 0.51 |
| 8.28501193113889 | 0.37 |
| 8.288073217361111 | 0.23 |
| 8.291132836805556 | 0.4 |
| 8.294193567416666 | 0.23 |
| 8.297254853611111 | 0.48 |
| 8.300314195277778 | 0.29 |
| 8.303379648388889 | 0.58 |
| 8.306439267833333 | 0.36 |
| 8.309498887277778 | 0.14 |
| 8.312559617888889 | 0.45 |
| 8.315618959555556 | 0.36 |
| 8.318678301194446 | 0.48 |
| 8.32174180975 | 0.53 |
| 8.324808374027779 | 0.41 |
| 8.32786966025 | 0.38 |
| 8.33093983586111 | 0.23 |
| 8.333998899694445 | 0.16 |
| 8.337059908111112 | 0.32 |
| 8.340123416666666 | 0.59 |
| 8.343182480527778 | 0.53 |
| 8.346247378055555 | 0.07 |
| 8.3493069975 | 0.5 |
| 8.352368839305555 | 0.17 |
| 8.355428736527779 | 0.5 |
| 8.358488355972222 | 0.53 |
| 8.361557698194446 | 0.14 |
| 8.36462120675 | 0.35 |
| 8.367682492972222 | 0 |
| 8.370742112416666 | 0.35 |
| 8.373803120833333 | 0.25 |
| 8.376863295861112 | 0.58 |
| 8.379923193083332 | 0.52 |
| 8.3829842015 | 0.37 |
| 8.386046043305555 | 0.42 |
| 8.389109829638889 | 0.35 |
| 8.392169449083333 | 0.17 |
| 8.395229901916666 | 0.16 |
| 8.398289243583333 | 0.55 |
| 8.401351363166667 | 0.27 |
| 8.404415982888889 | 0.1 |
| 8.407482824972222 | 0.72 |
| 8.410542166611112 | 0.16 |
| 8.413601508277777 | 0.47 |
| 8.416662516694444 | 0.19 |
| 8.419721858333334 | 0.33 |
| 8.422783977916668 | 0.51 |
| 8.425844152944444 | 0.45 |
| 8.4289076615 | 0.4 |
| 8.431968392138888 | 0.35 |
| 8.4350307895 | 0.28 |
| 8.438091797916666 | 0.24 |
| 8.441166696027778 | 0.47 |
| 8.444230760166667 | 0.47 |
| 8.447290935194445 | 0.49 |
| 8.450351388027778 | 0.58 |
| 8.453412952027778 | 0.57 |
| 8.456473960444445 | 0.41 |
| 8.4595408025 | 0.17 |
| 8.462600977555555 | 0.35 |
| 8.465660319194445 | 0.22 |
| 8.468720494222222 | 0.88 |
| 8.471780113666666 | 0.57 |
| 8.474847233555556 | 0.37 |
| 8.477910186527778 | 0.45 |
| 8.480975361833334 | 0.56 |
| 8.484039425972222 | 0.46 |
| 8.48710043438889 | 0.32 |
| 8.490160331638888 | 0.62 |
| 8.493220506666667 | 0.39 |
| 8.496286515361112 | 0.24 |
| 8.4993505795 | 0.37 |
| 8.50241131011111 | 0.31 |
| 8.505472318527778 | 0.39 |
| 8.508533882527777 | 0.56 |
| 8.511594890944444 | 0.15 |
| 8.51465506597222 | 0.48 |
| 8.517715518805556 | 0.66 |
| 8.520777082805555 | 0.41 |
| 8.523837257833334 | 0.59 |
| 8.526899655222222 | 0.34 |
| 8.529967608472221 | 0.28 |
| 8.533032228194445 | 0.34 |
| 8.536092681027778 | 0.41 |
| 8.539153411638889 | 0.19 |
| 8.542213864472222 | 0.07 |
| 8.545275706277778 | 0.4 |
| 8.548337270277777 | 0.48 |
| 8.551409668222222 | 0.08 |
| 8.554473732361112 | 0.23 |
| 8.557533351805555 | 0.16 |
| 8.56060324961111 | 0.25 |
| 8.563669813916666 | 0.44 |
| 8.566729155555555 | 0.24 |
| 8.569790719555556 | 0.46 |
| 8.572850616805555 | 0.61 |
| 8.575912736388888 | 0.42 |
| 8.578975133777778 | 0.41 |
| 8.582041142472223 | 0.35 |
| 8.585104651027777 | 0.51 |
| 8.58816538163889 | 0.34 |
| 8.591230279166668 | 0.16 |
| 8.594292954333334 | 0.3 |
| 8.59735618511111 | 0.32 |
| 8.600416082333334 | 0.44 |
| 8.603475979583333 | 0.18 |
| 8.606546432972221 | 0.1 |
| 8.609606330222222 | 0.41 |
| 8.612666783027779 | 0.31 |
| 8.615729736 | 0.33 |
| 8.618788799861111 | 0.37 |
| 8.621850086083333 | 0.38 |
| 8.624913872416666 | 0.44 |
| 8.62797432525 | 0.4 |
| 8.631036167055555 | 0.41 |
| 8.634095508694443 | 0.23 |
| 8.637155961527778 | 0.3 |
| 8.640220025666666 | 0.25 |
| 8.64328686775 | 0.36 |
| 8.646351765277778 | 0.16 |
| 8.649412218083334 | 0.31 |
| 8.6524826715 | 0.03 |
| 8.65554201313889 | 0.15 |
| 8.658606355083334 | 0.27 |
| 8.66166653011111 | 0.14 |
| 8.66472642736111 | 0.23 |
| 8.667792436055556 | 0.19 |
| 8.670852333277777 | 0.46 |
| 8.673911952722221 | 0.42 |
| 8.676971572166668 | 0.17 |
| 8.680033136166667 | 0.35 |
| 8.683093033416666 | 0.48 |
| 8.68615598638889 | 0.21 |
| 8.689216994805555 | 0.48 |
| 8.692287448194444 | 0.44 |
| 8.695349012194445 | 0.44 |
| 8.698415576472222 | 0.5 |
| 8.701479362833334 | 0.44 |
| 8.704539815666667 | 0.73 |
| 8.707599990694444 | 0.19 |
| 8.710660165722222 | 0.27 |
| 8.713743675416668 | 0.53 |
| 8.716808295138888 | 0.27 |
| 8.719868192388889 | 0.38 |
| 8.722927534027777 | 0.35 |
| 8.725987153472222 | 0.24 |
| 8.729052884388889 | 0.33 |
| 8.732111948250001 | 0.29 |
| 8.735172678861112 | 0.29 |
| 8.738234520666667 | 0.44 |
| 8.741299695972222 | 0.32 |
| 8.744358759833334 | 0.14 |
| 8.74742365736111 | 0.29 |
| 8.750484110194444 | 0.33 |
| 8.753556785944443 | 0.32 |
| 8.756618349944445 | 0.29 |
| 8.759686580972222 | 0.51 |
| 8.762745644833334 | 0.38 |
| 8.7658130425 | 0.36 |
| 8.76887293975 | 0.35 |
| 8.77194255975 | 0.3 |
| 8.775003568166667 | 0.23 |
| 8.778062909833334 | 0.53 |
| 8.781124751611111 | 0.37 |
| 8.784191315916667 | 0.33 |
| 8.7872534355 | 0.37 |
| 8.790322499916668 | 0.47 |
| 8.793381841583333 | 0.2 |
| 8.796443127777778 | 0.54 |
| 8.799503025027777 | 0.33 |
| 8.802567089166667 | 0.22 |
| 8.80562920875 | 0.56 |
| 8.808699939944445 | 0.31 |
| 8.811763170694444 | 0.51 |
| 8.81487029286111 | 0.25 |
| 8.817929912305555 | 0.29 |
| 8.820991476305554 | 0.37 |
| 8.82405192913889 | 0.47 |
| 8.827114604305555 | 0.42 |
| 8.830175057138888 | 0.43 |
| 8.833243565972221 | 0.55 |
| 8.836305129972223 | 0.21 |
| 8.839380861444445 | 0.36 |
| 8.84244048088889 | 0.37 |
| 8.845502878277777 | 0.5 |
| 8.848570275944445 | 0.14 |
| 8.851629339805555 | 0.53 |
| 8.854697015277777 | 0.51 |
| 8.85776385736111 | 0.53 |
| 8.860823754583333 | 0.33 |
| 8.863887263138889 | 0.44 |
| 8.866948827138888 | 0.23 |
| 8.870012057916668 | 0.55 |
| 8.873071399555554 | 0.48 |
| 8.876131574583333 | 0.32 |
| 8.879191194027777 | 0.23 |
| 8.88225164686111 | 0.32 |
| 8.8853109885 | 0.18 |
| 8.888371441333334 | 0.4 |
| 8.891431338583333 | 0.13 |
| 8.894497625055555 | 0.29 |
| 8.897580023583334 | 0.48 |
| 8.900654088305556 | 0.41 |
| 8.90371370775 | 0.17 |
| 8.906773327194445 | 0.46 |
| 8.90983683575 | 0.25 |
| 8.912899510916667 | 0.41 |
| 8.915961352722222 | 0.09 |
| 8.919022638916667 | 0.04 |
| 8.922081980583334 | 0.22 |
| 8.925145766916666 | 0.45 |
| 8.928206497555555 | 0.19 |
| 8.931268617138889 | 0.19 |
| 8.934329069972222 | 0.54 |
| 8.937389522777778 | 0.58 |
| 8.940449975611111 | 0.31 |
| 8.943509595055556 | 0.23 |
| 8.946572548027778 | 0.25 |
| 8.949646334944445 | 0.21 |
| 8.952723455388888 | 0.1 |
| 8.955783908222221 | 0.35 |
| 8.958844916638888 | 0.31 |
| 8.961908425194444 | 0.39 |
| 8.964967766833333 | 0.33 |
| 8.968032664361111 | 0.7 |
| 8.971096450722222 | 0.27 |
| 8.974159681472221 | 0.52 |
| 8.977220967694445 | 0.52 |
| 8.980287531972222 | 0.55 |
| 8.983349651555555 | 0.14 |
| 8.986410659972222 | 0.2 |
| 8.989470279416667 | 0.46 |
| 8.992531565611111 | 0.05 |
| 8.995594796388888 | 0.43 |
| 8.998654693611112 | 0.27 |
| 9.001714868638889 | 0.35 |
| 9.004775321472222 | 0.17 |
| 9.007834940916666 | 0.29 |
| 9.010900116250001 | 0.47 |
| 9.013961124666666 | 0.27 |
| 9.017022688666668 | 0.27 |
| 9.02008230811111 | 0.24 |
| 9.023146094444444 | 0.68 |
| 9.026206547277777 | 0.37 |
| 9.029270611416667 | 0.25 |
| 9.032331619833334 | 0.22 |
| 9.035394017222222 | 0.45 |
| 9.03845335886111 | 0.46 |
| 9.041517978583334 | 0.15 |
| 9.04457815363889 | 0.34 |
| 9.047656107444444 | 0.12 |
| 9.050720171583333 | 0.38 |
| 9.053779791027779 | 0.39 |
| 9.056840799444444 | 0.22 |
| 9.059904863583334 | 0.51 |
| 9.062966427583333 | 0.5 |
| 9.066026047027778 | 0.34 |
| 9.069087611027777 | 0.46 |
| 9.072149175055555 | 0.37 |
| 9.075209627861112 | 0.3 |
| 9.078272303055556 | 0.29 |
| 9.081333033666667 | 0.21 |
| 9.084400986916668 | 0.38 |
| 9.087464217666668 | 0.15 |
| 9.090537449 | 0.42 |
| 9.093604846666667 | 0.37 |
| 9.09666752186111 | 0.28 |
| 9.099727141305555 | 0.36 |
| 9.102793427805556 | 0.48 |
| 9.105853047250001 | 0.45 |
| 9.108913222277778 | 0.42 |
| 9.1119731195 | 0.48 |
| 9.115033294527779 | 0.46 |
| 9.118097914277778 | 0.38 |
| 9.121161978416666 | 0.31 |
| 9.124222153444446 | 0.36 |
| 9.127289273333334 | 0.56 |
| 9.130352781888888 | 0.36 |
| 9.13341434588889 | 0.4 |
| 9.136478687805557 | 0.49 |
| 9.139539140638888 | 0.33 |
| 9.142601260222222 | 0.61 |
| 9.14567115802778 | 0.35 |
| 9.148732999833333 | 0.48 |
| 9.151800953083333 | 0.34 |
| 9.154861405916666 | 0.4 |
| 9.157921025361112 | 0.46 |
| 9.16098342275 | 0.29 |
| 9.164042764388888 | 0.47 |
| 9.16710266163889 | 0.36 |
| 9.17016200327778 | 0.28 |
| 9.173221622722222 | 0.47 |
| 9.176284853472223 | 0.35 |
| 9.179349195416668 | 0.4 |
| 9.182409926027779 | 0.44 |
| 9.185469267694446 | 0.34 |
| 9.188529164916666 | 0.49 |
| 9.191589617750001 | 0.32 |
| 9.194651459555555 | 0.33 |
| 9.197726913222223 | 0.29 |
| 9.200786532666667 | 0.37 |
| 9.203851430194446 | 0.3 |
| 9.206912438611111 | 0.33 |
| 9.209972613638888 | 0.45 |
| 9.213032788666666 | 0.27 |
| 9.21609407488889 | 0.24 |
| 9.219156472277778 | 0.31 |
| 9.222216647305556 | 0.42 |
| 9.225279600277778 | 0.47 |
| 9.228345608972223 | 0.43 |
| 9.231411895472222 | 0.5 |
| 9.234473459472223 | 0.39 |
| 9.237533078916666 | 0.55 |
| 9.240595754083333 | 0.31 |
| 9.243654817944444 | 0.42 |
| 9.246714159583332 | 0.49 |
| 9.249782668416668 | 0.18 |
| 9.252842010083334 | 0.5 |
| 9.255904963055556 | -0.03 |
| 9.258967638222222 | 0.26 |
| 9.26202781325 | 0.17 |
| 9.265097711055557 | 0.37 |
| 9.268162330805556 | 0.18 |
| 9.271228895083334 | 0.37 |
| 9.274292125833332 | 0.28 |
| 9.277358134555556 | 0.31 |
| 9.280434699416668 | 0.41 |
| 9.283496541194443 | 0.3 |
| 9.286558383000001 | 0.27 |
| 9.289618280222223 | 0.44 |
| 9.292677899666668 | 0.03 |
| 9.295741963805556 | 0.31 |
| 9.298801861055555 | 0.43 |
| 9.301863980638888 | 0.26 |
| 9.30492554463889 | 0.23 |
| 9.307985719666668 | 0.52 |
| 9.311057562055556 | 0.35 |
| 9.314118570444446 | 0.08 |
| 9.317179856666666 | 0.34 |
| 9.320239476111112 | 0.34 |
| 9.323307984944444 | 0.42 |
| 9.326372882472223 | 0.41 |
| 9.329432501916665 | 0.2 |
| 9.332502121944446 | 0.64 |
| 9.335563408138889 | 0.26 |
| 9.338626083305556 | 0.47 |
| 9.341693203194446 | 0.25 |
| 9.344752822638888 | 0.25 |
| 9.347815497805556 | 0.58 |
| 9.350875395055555 | 0.53 |
| 9.353943626083334 | 0.42 |
| 9.357006579055556 | 0.45 |
| 9.360070087611112 | 0.62 |
| 9.363133318388888 | 0.15 |
| 9.366195160166667 | 0.38 |
| 9.369254501833334 | 0.46 |
| 9.372315232444445 | 0.36 |
| 9.375377074249998 | 0.37 |
| 9.378439749416666 | 0.13 |
| 9.381509369444444 | 0.66 |
| 9.384569266666666 | 0.47 |
| 9.38763055288889 | 0.54 |
| 9.39069850613889 | 0.35 |
| 9.393760347916666 | 0.34 |
| 9.396820522972222 | 0.39 |
| 9.399880697999999 | 0.22 |
| 9.402940039638889 | 0.44 |
| 9.405999659083335 | 0.39 |
| 9.409062889861112 | 0.25 |
| 9.412122787083334 | 0.27 |
| 9.41518629563889 | 0.18 |
| 9.418246192888889 | 0.15 |
| 9.421308868055556 | 0.4 |
| 9.4243684875 | 0.1 |
| 9.427430329305555 | 0.38 |
| 9.430489948750001 | 0.63 |
| 9.433554012888889 | 0.48 |
| 9.436614743500002 | 0.46 |
| 9.439675751916667 | 0.1 |
| 9.442736482527778 | 0.61 |
| 9.445795824194445 | 0.31 |
| 9.448859610527776 | 0.54 |
| 9.451927008194444 | 0.16 |
| 9.454987738833333 | 0.24 |
| 9.458068192777777 | 0.26 |
| 9.461128090027778 | 0.41 |
| 9.46418854286111 | 0.27 |
| 9.467252606999999 | 0.26 |
| 9.470319726861112 | 0.36 |
| 9.473379068527779 | 0.2 |
| 9.4764420215 | 0.39 |
| 9.479501363138889 | 0.36 |
| 9.48256431611111 | 0.33 |
| 9.485623935555555 | 0.45 |
| 9.488686610722223 | 0.46 |
| 9.491751230472223 | 0.2 |
| 9.494810572111112 | 0.58 |
| 9.497871580527777 | 0.64 |
| 9.500949256555556 | 0.27 |
| 9.504008875999999 | 0.49 |
| 9.507074051333333 | 0.45 |
| 9.5101367265 | 0.37 |
| 9.51320384636111 | 0.34 |
| 9.516264299194445 | 0.28 |
| 9.51932530761111 | 0.35 |
| 9.52238464925 | 0.31 |
| 9.52544371311111 | 0.09 |
| 9.528513055333333 | 0.35 |
| 9.531578786250002 | 0.48 |
| 9.534645628333335 | 0.24 |
| 9.537708303499999 | 0.05 |
| 9.540777367916666 | 0.43 |
| 9.543839765305556 | 0.49 |
| 9.546898829166668 | 0.45 |
| 9.549958448611111 | 0.26 |
| 9.553017790277778 | 0.39 |
| 9.55608657688889 | 0.52 |
| 9.559147307527779 | 0.1 |
| 9.562207482555555 | 0.27 |
| 9.565268490972223 | 0.42 |
| 9.568330332750001 | 0.37 |
| 9.571391341166667 | 0.18 |
| 9.574454294138889 | 0.05 |
| 9.577513635777777 | 0.44 |
| 9.580577144333333 | 0.57 |
| 9.583642041861111 | 0.35 |
| 9.586701383527778 | 0.5 |
| 9.589762391944445 | 0.4 |
| 9.592823122555556 | 0.48 |
| 9.595885519944444 | 0.38 |
| 9.598948472916666 | 0.44 |
| 9.602011425861111 | 0.32 |
| 9.605072989861112 | 0.5 |
| 9.608137331805557 | 0.51 |
| 9.611198895805556 | 0.38 |
| 9.614260459805555 | 0.38 |
| 9.617319523666668 | 0.45 |
| 9.620378865333334 | 0.25 |
| 9.623443485055555 | 0.2 |
| 9.626503382277777 | 0.37 |
| 9.6295646685 | 0.45 |
| 9.632630677194445 | 0.52 |
| 9.635690018833332 | 0.47 |
| 9.638757138722223 | 0.4 |
| 9.64181731375 | 0.37 |
| 9.644881933472222 | 0.51 |
| 9.647943497472223 | 0.38 |
| 9.651003394722222 | 0.25 |
| 9.654063291972221 | 0.16 |
| 9.657123189194444 | 0.34 |
| 9.660183642027778 | 0.52 |
| 9.663244928222221 | 0.46 |
| 9.666307881194445 | 0.57 |
| 9.669367778444444 | 0.54 |
| 9.67242739788889 | 0.15 |
| 9.675493128777777 | 0.4 |
| 9.678555526166665 | 0.4 |
| 9.681626812944444 | 0.58 |
| 9.68468865475 | 0.48 |
| 9.687753830055556 | 0.49 |
| 9.690817060833334 | 0.29 |
| 9.693891403333334 | 0.44 |
| 9.696951022777778 | 0.41 |
| 9.700014253527778 | 0.24 |
| 9.703080540027777 | 0.36 |
| 9.706184328666668 | 0.34 |
| 9.70925756 | 0.42 |
| 9.71231690163889 | 0.46 |
| 9.71537985461111 | 0.39 |
| 9.71843975186111 | 0.1 |
| 9.721505760555555 | 0.31 |
| 9.724569546916666 | 0.27 |
| 9.727633055472221 | 0.32 |
| 9.730693508277778 | 0.45 |
| 9.733762572722222 | 0.28 |
| 9.736824970111112 | 0.37 |
| 9.739887923055555 | 0.17 |
| 9.7429475425 | 0.32 |
| 9.746007717555555 | 0.54 |
| 9.749068170361111 | 0.55 |
| 9.752136401416667 | 0.52 |
| 9.755197409833333 | 0.32 |
| 9.758267863222223 | 0.44 |
| 9.761328038250001 | 0.35 |
| 9.764405992083333 | 0.46 |
| 9.7674670005 | 0.43 |
| 9.770528842305556 | 0.43 |
| 9.77359735113889 | 0.55 |
| 9.776691139194446 | 0.46 |
| 9.779754369972222 | 0.43 |
| 9.782814544999999 | 0.41 |
| 9.78587472002778 | 0.43 |
| 9.788942117694443 | 0.41 |
| 9.792013960055556 | 0.35 |
| 9.795076357444444 | 0.52 |
| 9.798147088638888 | 0.49 |
| 9.80121004161111 | 0.58 |
| 9.80428994 | 0.4 |
| 9.807369560583334 | 0.36 |
| 9.810429180027779 | 0.43 |
| 9.81348991063889 | 0.46 |
| 9.81655064125 | 0.29 |
| 9.81963665111111 | 0.51 |
| 9.822698770694444 | 0.57 |
| 9.825758667916666 | 0.26 |
| 9.828819120750001 | 0.28 |
| 9.831879295777778 | 0.36 |
| 9.834941693166666 | 0.46 |
| 9.838002146000001 | 0.18 |
| 9.841070654833333 | 0.18 |
| 9.844130829861111 | 0.24 |
| 9.847202394444444 | 0.38 |
| 9.850267291972221 | 0.5 |
| 9.853326911416667 | 0.32 |
| 9.85639069775 | 0.29 |
| 9.859452817333333 | 0.33 |
| 9.8625168815 | 0.33 |
| 9.865577889888888 | 0.33 |
| 9.868638342722223 | 0.5 |
| 9.871702684666666 | 0.44 |
| 9.87476397086111 | 0.48 |
| 9.877823590305555 | 0.41 |
| 9.88088376536111 | 0.07 |
| 9.883950329638889 | 0.23 |
| 9.887010782472222 | 0.37 |
| 9.890089291861111 | 0.65 |
| 9.893148911305556 | 0.18 |
| 9.89620991972222 | 0.41 |
| 9.899269816972222 | 0.33 |
| 9.902329992 | 0.19 |
| 9.905389333666667 | 0.46 |
| 9.908449786472223 | 0.33 |
| 9.911522184444445 | 0.4 |
| 9.914583192833332 | 0.37 |
| 9.91764892375 | 0.31 |
| 9.920710765555555 | 0.27 |
| 9.92377205175 | 0.42 |
| 9.926835004722221 | 0.39 |
| 9.929901569 | 0.1 |
| 9.93297646711111 | 0.47 |
| 9.93604053125 | 0.21 |
| 9.939100706277777 | 0.43 |
| 9.942170604083332 | 0.22 |
| 9.945233001472223 | 0.5 |
| 9.948292065333334 | 0.46 |
| 9.951353351527779 | 0.45 |
| 9.954415193333334 | 0.49 |
| 9.957512592722223 | 0.28 |
| 9.960576656861111 | 0.18 |
| 9.963641276583335 | 0.15 |
| 9.966701729416666 | 0.43 |
| 9.969764126777779 | 0.29 |
| 9.972826246388887 | 0.32 |
| 9.9758916995 | 0.53 |
| 9.978952152305556 | 0.13 |
| 9.982013438527778 | 0.38 |
| 9.985073891361111 | 0.01 |
| 9.988136566527778 | 0.4 |
| 9.991213686972221 | 0.41 |
| 9.994276917722223 | 0.23 |
| 9.99733764836111 | 0.13 |
| 10.000403934833333 | 0.27 |
| 10.003467165611111 | 0.39 |
| 10.00652734063889 | 0.25 |
| 10.00958723788889 | 0.26 |
| 10.012652135388889 | 0.38 |
| 10.015713977194444 | 0.29 |
| 10.018774430027777 | 0.56 |
| 10.021844605611111 | 0.17 |
| 10.02490533625 | 0.28 |
| 10.027965511277777 | 0.45 |
| 10.031028186444445 | 0.37 |
| 10.034088639277778 | 0.5 |
| 10.037161037222223 | 0.38 |
| 10.040220934472222 | 0.28 |
| 10.04328027611111 | 0.42 |
| 10.046339895555555 | 0.4 |
| 10.04940340411111 | 0.05 |
| 10.052466634888889 | 0.62 |
| 10.055530976805555 | 0.72 |
| 10.05859142963889 | 0.32 |
| 10.061651604666666 | 0.23 |
| 10.064712613083332 | 0.43 |
| 10.067771954749999 | 0.47 |
| 10.070831851972223 | 0.36 |
| 10.073893415972222 | 0.47 |
| 10.076953590999999 | 0.03 |
| 10.08001821075 | 0.48 |
| 10.083078107972224 | 0.27 |
| 10.086140227555555 | 0.41 |
| 10.089200402611112 | 0.43 |
| 10.092263633361112 | 0.5 |
| 10.095323808388889 | 0.24 |
| 10.098399262083333 | 0.31 |
| 10.101463326222222 | 0.4 |
| 10.104524056833332 | 0.51 |
| 10.107583120694445 | 0.33 |
| 10.110642184555555 | 0.39 |
| 10.113710137805556 | 0.25 |
| 10.116770312833333 | 0.53 |
| 10.119830210083334 | 0.26 |
| 10.12289371863889 | 0.39 |
| 10.12596472761111 | 0.43 |
| 10.129024624861112 | 0.04 |
| 10.132093689277777 | 0.39 |
| 10.135155253277777 | 0.11 |
| 10.138214872722221 | 0.32 |
| 10.141277547916665 | 0.37 |
| 10.14434216763889 | 0.62 |
| 10.14740206488889 | 0.36 |
| 10.15046196211111 | 0.31 |
| 10.15352213713889 | 0.38 |
| 10.156582589972222 | 0.17 |
| 10.159644153972222 | 0.27 |
| 10.162704051222223 | 0.41 |
| 10.165770893305556 | 0.31 |
| 10.1688321795 | 0.26 |
| 10.171891243361111 | 0.32 |
| 10.174961418972222 | 0.56 |
| 10.178021316194444 | 0.33 |
| 10.181086491527777 | 0.26 |
| 10.18414638875 | 0.32 |
| 10.187207397166667 | 0.45 |
| 10.190270072333332 | 0.43 |
| 10.193330247388888 | 0.37 |
| 10.196394033722223 | 0.23 |
| 10.19945337538889 | 0.13 |
| 10.202517439527778 | 0.42 |
| 10.20557900352778 | 0.36 |
| 10.208639178555556 | 0.28 |
| 10.211699631388887 | 0.53 |
| 10.214763417722223 | 0.29 |
| 10.217824148333333 | 0.5 |
| 10.220885990138887 | 0.19 |
| 10.223945331777777 | 0.39 |
| 10.227006617999999 | 0.52 |
| 10.230067626416666 | 0 |
| 10.233130857166666 | 0.33 |
| 10.236192698972223 | 0.17 |
| 10.2392750975 | 0.35 |
| 10.24233443913889 | 0.37 |
| 10.245401003416665 | 0.4 |
| 10.24846117847222 | 0.52 |
| 10.251524131444445 | 0.44 |
| 10.254593195861112 | 0.57 |
| 10.257652815305555 | 0.38 |
| 10.260724657666668 | 0.55 |
| 10.26379066636111 | 0.42 |
| 10.266850563611111 | 0.29 |
| 10.26990990525 | 0.17 |
| 10.272970358083334 | 0.6 |
| 10.276029977527777 | 0.39 |
| 10.27909515286111 | 0.28 |
| 10.282155883472221 | 0.24 |
| 10.285217169666666 | 0.29 |
| 10.288276233527778 | 0.22 |
| 10.291339464305555 | 0.23 |
| 10.294400472694445 | 0.36 |
| 10.29745981436111 | 0.29 |
| 10.300519711583332 | 0.17 |
| 10.303579886638888 | 0.39 |
| 10.3066470065 | 0.39 |
| 10.309706070361111 | 0.24 |
| 10.312772912444444 | 0.31 |
| 10.31583336527778 | 0.57 |
| 10.318892984722222 | 0.23 |
| 10.32195399311111 | 0.43 |
| 10.325035836055557 | 0.42 |
| 10.328095177722222 | 0.39 |
| 10.331157852888888 | 0.37 |
| 10.334223306 | 0.56 |
| 10.337282369861112 | 0.13 |
| 10.3403417115 | 0.27 |
| 10.34340160875 | 0.32 |
| 10.346463450527779 | 0.54 |
| 10.349526681305557 | 0.11 |
| 10.352586578527777 | 0.37 |
| 10.355646197972224 | 0.22 |
| 10.358713873444445 | 0.5 |
| 10.361776270833333 | 0.36 |
| 10.36483727925 | 0.38 |
| 10.367899121027778 | 0.51 |
| 10.370960962833333 | 0.48 |
| 10.374029193888889 | 0.24 |
| 10.377095480361112 | 0.34 |
| 10.380160655694445 | 0.37 |
| 10.383221941888888 | 0.35 |
| 10.3862826725 | 0.4 |
| 10.389345903277778 | 0.16 |
| 10.392407467277778 | 0.41 |
| 10.395467920111113 | 0.5 |
| 10.398528372916667 | 0.39 |
| 10.401587992361112 | 0.31 |
| 10.404648445194445 | 0.25 |
| 10.407707786833333 | 0.43 |
| 10.410769628638889 | 0.35 |
| 10.413829525888888 | 0.11 |
| 10.416889700916666 | 0.37 |
| 10.419949875944443 | 0.45 |
| 10.42300949538889 | 0.34 |
| 10.426070226 | 0.15 |
| 10.429137345888888 | 0.37 |
| 10.4321980765 | 0.51 |
| 10.435257418138889 | 0.35 |
| 10.438320093333333 | 0.53 |
| 10.441383879666667 | 0.26 |
| 10.444446277055556 | 0.01 |
| 10.447509230027778 | 0.58 |
| 10.45056912727778 | 0.49 |
| 10.453630691277779 | 0.27 |
| 10.456700311277778 | 0.38 |
| 10.459772153638887 | 0.31 |
| 10.46283427322222 | 0.33 |
| 10.465897226194445 | 0.45 |
| 10.468959068 | 0.29 |
| 10.472018409638888 | 0.35 |
| 10.47507830688889 | 0.35 |
| 10.478144037805555 | 0.49 |
| 10.481205879583333 | 0.66 |
| 10.484265499027778 | 0.45 |
| 10.487325396277779 | 0.2 |
| 10.490385571305556 | 0.27 |
| 10.493447413083333 | 0.43 |
| 10.496507865916668 | 0.39 |
| 10.49956915213889 | 0.37 |
| 10.50262988275 | 0.26 |
| 10.50568922438889 | 0 |
| 10.508749399416667 | 0.29 |
| 10.511815130333334 | 0.44 |
| 10.51488475036111 | 0.49 |
| 10.517946036555555 | 0.22 |
| 10.521007878361111 | 0.39 |
| 10.524067775583333 | 0.5 |
| 10.527127672833334 | 0.07 |
| 10.530187292277777 | 0.62 |
| 10.533248856277776 | 0.3 |
| 10.536309031305557 | 0.13 |
| 10.5393703175 | 0.25 |
| 10.542436603999999 | 0.12 |
| 10.545499556972223 | 0.15 |
| 10.548559732000001 | 0.31 |
| 10.551619073666668 | 0.39 |
| 10.554680915444443 | 0.37 |
| 10.557741646083333 | 0.23 |
| 10.560803765666666 | 0.4 |
| 10.563863385111112 | 0.54 |
| 10.566930227194446 | 0.36 |
| 10.56999068 | 0.38 |
| 10.573057244305556 | 0.12 |
| 10.576118530499999 | 0.3 |
| 10.579177872166666 | 0.35 |
| 10.58223776938889 | 0.37 |
| 10.5852985 | 0.4 |
| 10.588357841666667 | 0.26 |
| 10.591422183611112 | 0.32 |
| 10.594487636722222 | 0.31 |
| 10.597547256166665 | 0.4 |
| 10.60060632 | 0.02 |
| 10.603676217833332 | 0.46 |
| 10.606735559472222 | 0.47 |
| 10.609797401277778 | 0.48 |
| 10.612858409666666 | 0.34 |
| 10.615918862500001 | 0.47 |
| 10.6189804265 | 0.43 |
| 10.62204115713889 | 0.14 |
| 10.625103554499999 | 0.12 |
| 10.628166507472223 | 0.59 |
| 10.631225849138888 | 0.24 |
| 10.634286579749999 | 0.36 |
| 10.637351477277777 | 0.53 |
| 10.640412763472222 | 0.55 |
| 10.643472382916668 | 0.41 |
| 10.646542002944445 | 0.31 |
| 10.649606067083335 | 0.28 |
| 10.652667353277778 | 0.5 |
| 10.655726694944445 | 0.48 |
| 10.65879437038889 | 0.11 |
| 10.661861490277778 | 0.24 |
| 10.664934443805555 | 0.22 |
| 10.668001563694444 | 0.37 |
| 10.671067294583334 | 0.24 |
| 10.674128303 | -0.04 |
| 10.677187644666667 | 0.38 |
| 10.680248097472223 | 0.44 |
| 10.683309105888888 | 0.33 |
| 10.686368447555557 | 0.31 |
| 10.689428067 | 0.21 |
| 10.692489908777778 | 0.27 |
| 10.695549250444445 | 0.01 |
| 10.698616092527779 | -0.02 |
| 10.701675711972223 | 0.34 |
| 10.704736164777778 | 0.18 |
| 10.707806895972222 | 0.17 |
| 10.710868182194444 | 0.34 |
| 10.713928357222223 | 0.3 |
| 10.716988254444445 | 0.56 |
| 10.72004787388889 | 0.19 |
| 10.723108048944445 | 0.26 |
| 10.72616933513889 | 0.32 |
| 10.72922923238889 | 0.3 |
| 10.732293574305556 | 0.29 |
| 10.735352915972223 | 0.58 |
| 10.738412535416666 | -0.07 |
| 10.741472988222222 | 0.35 |
| 10.744532885472221 | 0.46 |
| 10.747602783277777 | 0.27 |
| 10.750665180666665 | 0.4 |
| 10.753728411416667 | 0.13 |
| 10.756794975722222 | 0.14 |
| 10.759857928694444 | 0.31 |
| 10.762923937388889 | 0.45 |
| 10.765988279305557 | 0.35 |
| 10.769065121972222 | 0.34 |
| 10.772129741694444 | 0.2 |
| 10.775193805833332 | 0.44 |
| 10.77825564763889 | 0.35 |
| 10.781319433999998 | 0.28 |
| 10.784378775638888 | 0.31 |
| 10.787438117277777 | 0.35 |
| 10.790498014527778 | 0.31 |
| 10.793559300722222 | 0.36 |
| 10.796619753555555 | 0.26 |
| 10.799679372999998 | 0.13 |
| 10.80273927025 | 0.25 |
| 10.805800000861112 | 0.45 |
| 10.808866287361111 | 0.25 |
| 10.81193757413889 | 0.38 |
| 10.814999693722223 | 0.48 |
| 10.818060424333334 | 0.53 |
| 10.821126433027779 | 0.27 |
| 10.824186330277778 | 0.43 |
| 10.827282340694445 | 0.23 |
| 10.830341682333334 | 0.38 |
| 10.83340269075 | 0.49 |
| 10.836468143861111 | 0.19 |
| 10.839538041666666 | 0.21 |
| 10.84259932788889 | 0.12 |
| 10.845661725277777 | 0.28 |
| 10.848731345277779 | 0.25 |
| 10.85179040913889 | 0.45 |
| 10.854850584166666 | 0.29 |
| 10.857910203611112 | 0.21 |
| 10.860973156583334 | 0.36 |
| 10.864033609416666 | 0.38 |
| 10.867092951055556 | 0.29 |
| 10.870154792861111 | 0.2 |
| 10.873215245694444 | 0.23 |
| 10.876274865138889 | 0.18 |
| 10.879335873555556 | 0.27 |
| 10.882396326361112 | 0.33 |
| 10.885455668027777 | 0.23 |
| 10.88851778761111 | 0.46 |
| 10.89158435188889 | 0.23 |
| 10.8946450825 | 0.26 |
| 10.897715535916666 | 0.19 |
| 10.900782377999999 | 0.51 |
| 10.903842275222223 | 0.35 |
| 10.90690939511111 | 0.15 |
| 10.909970125722221 | 0.48 |
| 10.91302946736111 | 0.49 |
| 10.91609103136111 | 0.16 |
| 10.919152317583332 | 0.27 |
| 10.922213603777777 | 0.53 |
| 10.92527655675 | 0.37 |
| 10.928337842972223 | 0.16 |
| 10.931400240333332 | 0.24 |
| 10.934463748888888 | 0.43 |
| 10.937528646416668 | 0.28 |
| 10.940589654833333 | 0.39 |
| 10.94365233 | 0.3 |
| 10.94671222725 | 0.16 |
| 10.949772402277778 | 0.33 |
| 10.952831743944444 | 0.53 |
| 10.955893585722222 | 0.32 |
| 10.958974317500001 | 0.14 |
| 10.962035048111112 | 0.31 |
| 10.965094667555556 | 0.2 |
| 10.968163176388888 | 0.34 |
| 10.971222795833334 | 0.36 |
| 10.974283526472224 | 0.21 |
| 10.977345090472223 | 0.37 |
| 10.980408599027777 | 0.11 |
| 10.983468218472222 | -0.03 |
| 10.986528115694444 | 0.02 |
| 10.989589124111111 | 0.44 |
| 10.992651521500001 | 0.32 |
| 10.99571086313889 | 0.21 |
| 10.998772704944445 | 0.11 |
| 11.001832602166667 | 0.34 |
| 11.004892221611112 | 0.28 |
| 11.007951841055554 | 0.2 |
| 11.011015071833333 | 0.32 |
| 11.014078302583334 | 0.1 |
| 11.017142366722222 | 0.18 |
| 11.020206986472221 | 0.43 |
| 11.02326799488889 | 0.36 |
| 11.026328169916667 | 0.59 |
| 11.029399734472223 | 0.42 |
| 11.032458798333332 | 0.42 |
| 11.0355214735 | 0.57 |
| 11.03858609325 | 0.45 |
| 11.041648212833334 | 0.61 |
| 11.044709499027778 | 0.33 |
| 11.04777217422222 | 0.5 |
| 11.050832904833333 | 0.4 |
| 11.053894468833334 | 0.26 |
| 11.05695547725 | 0.37 |
| 11.060021208138888 | 0.14 |
| 11.063081383194444 | 0.39 |
| 11.06614489175 | 0.32 |
| 11.069206177944444 | 0.02 |
| 11.072268297527778 | 0.09 |
| 11.075329861527777 | 0.16 |
| 11.078390869944444 | 0.22 |
| 11.081458267611112 | 0.22 |
| 11.084517609277777 | 0.17 |
| 11.087577228722223 | 0.29 |
| 11.090637125944443 | 0.19 |
| 11.093700912305556 | 0.32 |
| 11.096769698944446 | 0.49 |
| 11.099831818527779 | 0.54 |
| 11.102900605166667 | 0.26 |
| 11.105962169166666 | 0.43 |
| 11.109028733444445 | 0.09 |
| 11.112093353166665 | 0.32 |
| 11.115156028361111 | 0.48 |
| 11.118215647805554 | 0.49 |
| 11.121274989444444 | 0.03 |
| 11.12433544227778 | 0.36 |
| 11.127399784194445 | 0.28 |
| 11.130467459666667 | 0.35 |
| 11.133529579249998 | 0.4 |
| 11.136590865472222 | 0.3 |
| 11.13965826313889 | 0.16 |
| 11.142718160361111 | 0.33 |
| 11.145782224500001 | 0.34 |
| 11.148843510722221 | 0.21 |
| 11.15190507472222 | 0.25 |
| 11.154969694444445 | 0.36 |
| 11.158032925222223 | 0.66 |
| 11.161098378333334 | 0.6 |
| 11.16416272025 | 0.34 |
| 11.167223450888889 | 0.31 |
| 11.170291681916666 | 0.08 |
| 11.173353245916665 | 0.37 |
| 11.176420921388889 | 0.24 |
| 11.179481374222222 | 0.59 |
| 11.182542660416667 | 0.3 |
| 11.185608946916666 | 0.44 |
| 11.1886710665 | 0.22 |
| 11.19173013036111 | 0.58 |
| 11.194796139055555 | 0.4 |
| 11.197857147472224 | 0.09 |
| 11.200922322777778 | 0.19 |
| 11.20398194222222 | 0.56 |
| 11.207047395333332 | 0.3 |
| 11.210108125972221 | 0.29 |
| 11.213176634805556 | 0.38 |
| 11.216236532055554 | 0.33 |
| 11.219305318694444 | 0.38 |
| 11.222368549444445 | 0.36 |
| 11.225431502416667 | 0.42 |
| 11.228496955527778 | 0.37 |
| 11.231600744166666 | 0.32 |
| 11.23466036361111 | 0.24 |
| 11.237723872166665 | 0.44 |
| 11.240787102916666 | 0.3 |
| 11.24385616736111 | 0.27 |
| 11.246915786805555 | 0.36 |
| 11.249975128444445 | 0.58 |
| 11.253038081416667 | 0.33 |
| 11.25610575688889 | 0.61 |
| 11.259170098805555 | 0.16 |
| 11.262250552777779 | 0.16 |
| 11.265312672361112 | 0.54 |
| 11.268389237222221 | 0.26 |
| 11.271454412555556 | 0.15 |
| 11.274519310083335 | 0.26 |
| 11.27761143138889 | 0.08 |
| 11.280674384333333 | 0.42 |
| 11.283759005222223 | 0.45 |
| 11.286818902472222 | 0.41 |
| 11.289884355583332 | 0.33 |
| 11.292947308527777 | 0.17 |
| 11.296018039722224 | 0.52 |
| 11.299087104166667 | 0.43 |
| 11.302148112583334 | 0.37 |
| 11.305219954944445 | 0.19 |
| 11.308280129972223 | 0.28 |
| 11.311339749416666 | 0.19 |
| 11.314406313694445 | 0.38 |
| 11.31746593313889 | 0.13 |
| 11.320528052722223 | 0.43 |
| 11.323605450972224 | 0.27 |
| 11.326664792638889 | 0.34 |
| 11.329724967666667 | 0.33 |
| 11.332786809444444 | 0.29 |
| 11.335849206833334 | 0.37 |
| 11.338911882 | 0.47 |
| 11.34197177925 | 0.08 |
| 11.345031676472223 | 0.31 |
| 11.348101574305556 | 0.31 |
| 11.351160915944444 | 0.45 |
| 11.35422109097222 | 0.2 |
| 11.357281543805556 | 0.04 |
| 11.36034116325 | 0.44 |
| 11.363457452611112 | 0.1 |
| 11.366523461305555 | 0.51 |
| 11.369584191916665 | 0.44 |
| 11.372645200333334 | 0.34 |
| 11.37570620875 | 0.41 |
| 11.378769995083335 | 0.34 |
| 11.38183017013889 | 0.36 |
| 11.38489173413889 | 0.38 |
| 11.387951075777778 | 0.34 |
| 11.39101402875 | 0.37 |
| 11.394073648194444 | 0.17 |
| 11.397173825500001 | 0.39 |
| 11.400238723027778 | 0.62 |
| 11.403300287027777 | 0.53 |
| 11.40636073986111 | 0.22 |
| 11.409427859722223 | 0.13 |
| 11.412491646083332 | 0.5 |
| 11.415556265805556 | 0.33 |
| 11.418618385416666 | 0.34 |
| 11.421686338666667 | 0.24 |
| 11.424750680583333 | 0.41 |
| 11.427811688999999 | 0.2 |
| 11.430872141833333 | 0.48 |
| 11.433934261416667 | 0.11 |
| 11.436999714527778 | 0.28 |
| 11.440061278527777 | 0.17 |
| 11.443121175777778 | 0.43 |
| 11.446182184194445 | 0.44 |
| 11.449245970527778 | 0.43 |
| 11.452310590277778 | 0.36 |
| 11.455373543222223 | 0.28 |
| 11.4584495525 | 0.57 |
| 11.461514450027778 | 0.33 |
| 11.464579625361111 | 0.48 |
| 11.467639244805556 | 0.58 |
| 11.470700253194446 | 0.32 |
| 11.473760706027777 | 0.32 |
| 11.476821714444444 | 0.36 |
| 11.479899112694444 | 0.48 |
| 11.482961787861111 | 0.32 |
| 11.486027240972222 | 0.45 |
| 11.489102139055555 | 0.47 |
| 11.49216231411111 | 0.35 |
| 11.495222211333335 | 0.49 |
| 11.49829683163889 | 0.18 |
| 11.501357006666666 | 0.43 |
| 11.50441995963889 | 0.23 |
| 11.507481801444444 | 0.19 |
| 11.510552254833332 | 0.48 |
| 11.513617430138888 | 0.31 |
| 11.516677327388889 | 0.19 |
| 11.519746947416667 | 0.18 |
| 11.522807678027778 | 0.32 |
| 11.525878687 | 0.38 |
| 11.528941084388888 | 0.17 |
| 11.53200014825 | 0.27 |
| 11.53506199002778 | 0.3 |
| 11.538124387416667 | 0.47 |
| 11.541184562444444 | 0.44 |
| 11.544245848666668 | 0.4 |
| 11.547306023694444 | -0.05 |
| 11.550365643138889 | 0.31 |
| 11.553424984777777 | 0.18 |
| 11.55648404863889 | 0.42 |
| 11.559544223666668 | 0.26 |
| 11.562606065472222 | 0.2 |
| 11.56566707388889 | 0.16 |
| 11.568728360083332 | 0.32 |
| 11.571791313055556 | 0.22 |
| 11.5748509325 | 0.23 |
| 11.577914441055556 | 0.19 |
| 11.580977671833335 | 0.55 |
| 11.584036735694445 | 0.6 |
| 11.587104966722222 | 0.47 |
| 11.590166252944444 | 0.49 |
| 11.593231428249998 | 0.35 |
| 11.596292436666667 | 0.24 |
| 11.599352333916666 | 0.34 |
| 11.602414453500002 | 0.51 |
| 11.60547685086111 | 0.49 |
| 11.608536192527778 | 0.2 |
| 11.611595534166668 | 0.28 |
| 11.614657375972222 | 0.37 |
| 11.617717550999998 | 0.31 |
| 11.620778559416667 | 0.55 |
| 11.623838456666666 | 0.43 |
| 11.626899187277777 | 0.08 |
| 11.629963529222223 | 0.29 |
| 11.633024259833334 | 0.28 |
| 11.636084434861111 | 0.13 |
| 11.63915488825 | 0.31 |
| 11.642216730055557 | 0.29 |
| 11.645281905361111 | 0.22 |
| 11.648348469666667 | 0.18 |
| 11.651410311444446 | 0.19 |
| 11.654471597666666 | 0.34 |
| 11.657531772694444 | 0.37 |
| 11.660591114333332 | 0.5 |
| 11.663651567166667 | 0.37 |
| 11.666717020277778 | 0.29 |
| 11.669780251027777 | 0.42 |
| 11.672841815027779 | 0.37 |
| 11.675901156694444 | 0.21 |
| 11.678961609527779 | 0.68 |
| 11.682021228972221 | 0.4 |
| 11.685084459722223 | 0.12 |
| 11.688145468138888 | 0.41 |
| 11.691205365388889 | 0.37 |
| 11.694267207166668 | 0.18 |
| 11.697327937777779 | 0.34 |
| 11.700387279444444 | 0.37 |
| 11.703450788 | 0.28 |
| 11.706510407444444 | 0.55 |
| 11.709589472444444 | 0.01 |
| 11.712650480861111 | 0.2 |
| 11.715711211472222 | 0.24 |
| 11.718770553138889 | 0.4 |
| 11.72183045036111 | 0.41 |
| 11.724900348166665 | 0.42 |
| 11.727966079083334 | 0.37 |
| 11.731028476472222 | 0.2 |
| 11.734093373972222 | 0.44 |
| 11.737153826805557 | 0.4 |
| 11.740216779777779 | 0.45 |
| 11.74328223288889 | 0.31 |
| 11.746343519111111 | 0.55 |
| 11.74940369413889 | 0.22 |
| 11.752464146944444 | 0.7 |
| 11.755523210805556 | 0.28 |
| 11.758583941444446 | 0.38 |
| 11.761648838944444 | 0.43 |
| 11.76470818061111 | 0.11 |
| 11.76776835563889 | 0.48 |
| 11.770832419777777 | 0.24 |
| 11.77389287261111 | 0.57 |
| 11.776953881027778 | 0.38 |
| 11.780017389583334 | 0.39 |
| 11.78308089813889 | 0.4 |
| 11.786145517861112 | 0.38 |
| 11.789205137305556 | 0.33 |
| 11.792264756749999 | 0.46 |
| 11.795328265305555 | 0.44 |
| 11.798391496083333 | 0.74 |
| 11.801454726833333 | 0.46 |
| 11.80451573525 | 0.24 |
| 11.80757646586111 | 0.51 |
| 11.810636918694444 | 0.09 |
| 11.813700982833334 | 0.51 |
| 11.816761435666667 | 0.35 |
| 11.819825221999999 | 0.07 |
| 11.822893730861113 | 0.5 |
| 11.825953628083333 | 0.39 |
| 11.829016303277777 | 0.5 |
| 11.832077589472222 | 0.36 |
| 11.835138597888887 | 0.42 |
| 11.83820071747222 | 0.36 |
| 11.84126394825 | 0.1 |
| 11.844323845472223 | 0.26 |
| 11.847384576083334 | 0.21 |
| 11.85045280713889 | 0.3 |
| 11.853512148805557 | 0.51 |
| 11.856577601916667 | 0.35 |
| 11.859636943555556 | 0.4 |
| 11.862703785638889 | 0.44 |
| 11.865767016388888 | 0.4 |
| 11.868826358055555 | 0.19 |
| 11.8718940335 | 0.33 |
| 11.87495865325 | 0.07 |
| 11.878019106055557 | 0.21 |
| 11.881082059027777 | 0.3 |
| 11.884145845388888 | 0.29 |
| 11.887205187027778 | 0.08 |
| 11.890265362055555 | 0.15 |
| 11.893327481666667 | 0.32 |
| 11.896386823305555 | 0.62 |
| 11.899453109805554 | 0.22 |
| 11.902512451444444 | 0.34 |
| 11.905572626472221 | 0.35 |
| 11.908632523722222 | 0.26 |
| 11.911691865361112 | 0.38 |
| 11.914751207027779 | 0.49 |
| 11.91781499336111 | 0.3 |
| 11.920875168416666 | 0.66 |
| 11.92394145488889 | 0.16 |
| 11.927004407861112 | 0.6 |
| 11.930065138472223 | 0.5 |
| 11.933128091444445 | 0.36 |
| 11.936190211027778 | 0.55 |
| 11.939258164305556 | 0.35 |
| 11.942322228444443 | 0.61 |
| 11.945381292305555 | 0.65 |
| 11.948444800861111 | 0.37 |
| 11.951504698083333 | 0.4 |
| 11.954569595611112 | 0.45 |
| 11.957628937277779 | 0.72 |
| 11.960692445833335 | 0.54 |
| 11.963752065277777 | 0.24 |
| 11.966811684722222 | 0.25 |
| 11.969874082083333 | 0.28 |
| 11.972934534916666 | 0.27 |
| 11.975995543333333 | 0.41 |
| 11.979055162777778 | 0.42 |
| 11.982116726777777 | 0.35 |
| 11.985183291055556 | 0.42 |
| 11.988242632722223 | 0.44 |
| 11.991303085527777 | 0.48 |
| 11.994363260583333 | 0.43 |
| 11.997425380166666 | 0.32 |
| 12.000487777527779 | 0.37 |
| 12.003553508444444 | 0.32 |
| 12.006613961277779 | 0.36 |
| 12.00967941438889 | 0.27 |
| 12.01273931161111 | 0.39 |
| 12.015806153694443 | 0.37 |
| 12.018867717694443 | 0.41 |
| 12.021942893583333 | 0.43 |
| 12.025004179805556 | 0.34 |
| 12.028066577166667 | 0.18 |
| 12.031129530138887 | 0.24 |
| 12.034189427388888 | 0.23 |
| 12.037250713583333 | 0.43 |
| 12.040313110972221 | 0.3 |
| 12.043376897333333 | 0.47 |
| 12.046444294999999 | 0.3 |
| 12.04950502561111 | 0.45 |
| 12.052566867416667 | 0.51 |
| 12.055630653749999 | 0.53 |
| 12.058698329222223 | 0.56 |
| 12.061759059833333 | 0.58 |
| 12.06482479075 | 0.3 |
| 12.067885521361111 | 0.37 |
| 12.070947640944445 | 0.23 |
| 12.074015316416666 | 0.22 |
| 12.077076324833333 | 0.31 |
| 12.080142611305556 | 0.33 |
| 12.083205008694444 | 0.58 |
| 12.086268795055556 | 0.05 |
| 12.089332303611112 | 0.2 |
| 12.092403034805555 | 0.45 |
| 12.095462932027777 | 0.47 |
| 12.098522273694444 | 0.3 |
| 12.101583004305555 | 0.55 |
| 12.10464262375 | 0.36 |
| 12.10770835463889 | 0.52 |
| 12.110769085277779 | 0.37 |
| 12.113851483805556 | 0.38 |
| 12.116910825444446 | 0.12 |
| 12.119976000777777 | 0.63 |
| 12.123040620500001 | 0.42 |
| 12.126106629194446 | 0.53 |
| 12.129166804222223 | 0.11 |
| 12.132227812638888 | 0.37 |
| 12.13528854325 | 0.61 |
| 12.138352885194443 | 0.32 |
| 12.14142111625 | 0.3 |
| 12.144480180111112 | 0.29 |
| 12.14754174411111 | 0.51 |
| 12.150611641916667 | 0.23 |
| 12.15367709502778 | 0.22 |
| 12.156736436666666 | 0.32 |
| 12.15979911186111 | 0.2 |
| 12.162859842472221 | 0.38 |
| 12.165924462194445 | -0.03 |
| 12.169000749277778 | 0.14 |
| 12.172062313277777 | 0.14 |
| 12.175128877555556 | 0.32 |
| 12.178190441555556 | 0.41 |
| 12.181253116722223 | 0.4 |
| 12.18431245838889 | 0.33 |
| 12.187371800027776 | 0.59 |
| 12.190433641833334 | 0.26 |
| 12.193499094944444 | 0.6 |
| 12.196569548333333 | 0.26 |
| 12.199631945722222 | 0.14 |
| 12.202691565166667 | 0.22 |
| 12.205755629305555 | 0.24 |
| 12.208816359916666 | 0.33 |
| 12.211890980222222 | 0.24 |
| 12.214952822027778 | 0.49 |
| 12.218019386305556 | 0.25 |
| 12.221085395 | 0.34 |
| 12.224149459138888 | 0.07 |
| 12.227211300944445 | 0.35 |
| 12.230272031555556 | 0.35 |
| 12.233332206583333 | 0.56 |
| 12.236393215 | 0.18 |
| 12.239457001361112 | 0.1 |
| 12.242518287555557 | 0.31 |
| 12.245578740388888 | 0.5 |
| 12.248638082027778 | 0.24 |
| 12.251698257055555 | 0.34 |
| 12.254763710194444 | 0.1 |
| 12.257823607416666 | 0.33 |
| 12.260883226861111 | 0.44 |
| 12.263947568805555 | 0.54 |
| 12.267009966194445 | 0.33 |
| 12.270069863416667 | 0.41 |
| 12.273131983 | 0.33 |
| 12.276192991416666 | 0.6 |
| 12.27925427763889 | 0.39 |
| 12.28231750838889 | 0.24 |
| 12.285379072388888 | 0.48 |
| 12.288438414027777 | 0.41 |
| 12.291512200972223 | 0.4 |
| 12.294572376 | 0.18 |
| 12.297643662777777 | 0.34 |
| 12.300702726638889 | -0.05 |
| 12.303762346083333 | 0.17 |
| 12.306822243305556 | 0.43 |
| 12.309883251722221 | 0.13 |
| 12.31294259338889 | 0.15 |
| 12.316020269416667 | 0.05 |
| 12.319080444444444 | 0.24 |
| 12.322140619472222 | 0.29 |
| 12.325202183472223 | 0.08 |
| 12.32826541425 | 0.26 |
| 12.331325311472222 | 0.28 |
| 12.334386319888889 | 0.14 |
| 12.337450661833333 | 0.34 |
| 12.34051167025 | 0.35 |
| 12.343580179083332 | 0.46 |
| 12.346642298666666 | 0.33 |
| 12.34970830736111 | 0.3 |
| 12.352767649027777 | 0.24 |
| 12.35583226875 | 0.54 |
| 12.358892999361112 | 0.39 |
| 12.361953452194443 | 0.01 |
| 12.365013349444444 | 0.15 |
| 12.368073246666667 | 0.18 |
| 12.371133421694445 | 0.35 |
| 12.3742033195 | 0.13 |
| 12.377265161305555 | 0.18 |
| 12.380325058555556 | 0.38 |
| 12.383392734000001 | 0.51 |
| 12.386457631527778 | 0.32 |
| 12.389517250972222 | 0.27 |
| 12.392585759805556 | 0.07 |
| 12.395647323805555 | 0.4 |
| 12.398708054444445 | 0.41 |
| 12.401769618444444 | 0.5 |
| 12.404835904916666 | 0.24 |
| 12.407904413777779 | 0.58 |
| 12.410966811166666 | 0.08 |
| 12.414026430611111 | 0.35 |
| 12.417086883416667 | 0.22 |
| 12.42014733625 | 0.07 |
| 12.423210011416666 | 0.32 |
| 12.426269353083333 | 0.27 |
| 12.429334528388889 | 0.45 |
| 12.432394981222222 | 0.38 |
| 12.43545904536111 | 0.1 |
| 12.438519498194445 | 0.22 |
| 12.441579395416667 | 0.28 |
| 12.44464457075 | 0.31 |
| 12.447728080444445 | 0.4 |
| 12.450791033416667 | 0.41 |
| 12.453857597694446 | 0.27 |
| 12.45693471813889 | 0.08 |
| 12.4599985045 | 0.42 |
| 12.46306645775 | 0.28 |
| 12.466129410722221 | 0.46 |
| 12.469192085888888 | 0.46 |
| 12.472254761055556 | 0.28 |
| 12.475326603444444 | 0.04 |
| 12.478389556416666 | 0.51 |
| 12.481451398194444 | 0.16 |
| 12.48451324 | 0.08 |
| 12.487575637361111 | 0.28 |
| 12.490642479444444 | 0.3 |
| 12.493703487861112 | 0.36 |
| 12.496767829805556 | 0.45 |
| 12.499837172027778 | 0.22 |
| 12.502896513666666 | 0.33 |
| 12.505956688722222 | 0.05 |
| 12.509017141527778 | 0.16 |
| 12.512087872722223 | 0.31 |
| 12.515147492166667 | 0.34 |
| 12.51821183411111 | 0.47 |
| 12.521271731333332 | 0.1 |
| 12.524331073 | 0.17 |
| 12.527390414638889 | 0.36 |
| 12.530451978638888 | 0.38 |
| 12.533512431472223 | 0.3 |
| 12.536572050916666 | 0.41 |
| 12.53963333711111 | 0.14 |
| 12.5426957345 | 0.1 |
| 12.545757854083334 | 0.32 |
| 12.548818306916667 | 0.13 |
| 12.551878481944446 | 0.45 |
| 12.554937823611112 | 0.31 |
| 12.557997443055555 | 0.29 |
| 12.56105734027778 | 0.39 |
| 12.56411779311111 | 0.52 |
| 12.567177412555555 | 0.47 |
| 12.570237032 | 0.49 |
| 12.57329637363889 | 0.55 |
| 12.576358215444444 | 0.55 |
| 12.579418390472222 | 0.2 |
| 12.582483287999999 | 0.56 |
| 12.585550685666666 | 0.18 |
| 12.588610027333333 | 0.16 |
| 12.591674647055555 | 0.36 |
| 12.5947342665 | 0.25 |
| 12.597797497250001 | 0.48 |
| 12.600857672277778 | 0.21 |
| 12.603918125111113 | 0.13 |
| 12.60697830013889 | 0.46 |
| 12.610047920166668 | 0.72 |
| 12.613109206361113 | 0.32 |
| 12.616168548027778 | 0.23 |
| 12.619240112583332 | 0.32 |
| 12.622300843222222 | 0.32 |
| 12.625362685 | 0.24 |
| 12.628425637972223 | 0.37 |
| 12.631484701833333 | 0.51 |
| 12.634547932583333 | 0.12 |
| 12.637607552027779 | 0.48 |
| 12.640668838249999 | 0.38 |
| 12.64373040225 | 0.25 |
| 12.646794744194445 | 0.16 |
| 12.649862141861112 | 0.35 |
| 12.652929817305555 | 0.47 |
| 12.655991936888888 | 0.35 |
| 12.659052389722222 | 0.26 |
| 12.662112842555556 | 0.36 |
| 12.665172184194445 | 0.25 |
| 12.668232359222221 | 0.47 |
| 12.671292534277777 | 0.22 |
| 12.674351875916667 | 0.49 |
| 12.677417051222223 | 0.3 |
| 12.680485282277779 | 0.27 |
| 12.683551290972222 | 0.46 |
| 12.686613132777778 | 0.21 |
| 12.689680252638889 | 0.26 |
| 12.692739872083333 | 0.16 |
| 12.695805603 | 0.24 |
| 12.698866333611111 | 0.27 |
| 12.701934286861112 | 0.49 |
| 12.704997795444445 | 0.32 |
| 12.70805824825 | 0.4 |
| 12.711117312111112 | 0.2 |
| 12.714185543166668 | 0.27 |
| 12.717246829361113 | 0.31 |
| 12.720308393361112 | 0.22 |
| 12.723371346333334 | -0.11 |
| 12.726431799166665 | 0.27 |
| 12.729491418611111 | 0.11 |
| 12.732552427027777 | 0.15 |
| 12.735612046472221 | 0.21 |
| 12.738682777666666 | 0.09 |
| 12.741745452833333 | 0.38 |
| 12.744805072277778 | 0.35 |
| 12.747865802888889 | 0.16 |
| 12.750926255722222 | 0.2 |
| 12.753986152972221 | 0.13 |
| 12.75707521852778 | 0.43 |
| 12.760135115777777 | 0.31 |
| 12.7631997355 | 0.23 |
| 12.76627630036111 | 0.57 |
| 12.769337864361113 | 0.06 |
| 12.77239803938889 | 0.46 |
| 12.775457381055556 | 0.3 |
| 12.77851783386111 | 0.15 |
| 12.781586064916667 | 0.17 |
| 12.784645962166667 | 0.39 |
| 12.7877097485 | 0.21 |
| 12.79077770175 | 0.29 |
| 12.793842877083334 | 0.28 |
| 12.796913330472222 | 0.33 |
| 12.799978505805555 | 0.61 |
| 12.803046459055555 | 0.11 |
| 12.8061141345 | 0.05 |
| 12.809183198944446 | 0.36 |
| 12.812258374833334 | 0.31 |
| 12.815318272055556 | 0.25 |
| 12.818379558277776 | 0.28 |
| 12.8214394555 | 0.36 |
| 12.824510186694445 | 0.24 |
| 12.827569528361112 | 0.48 |
| 12.830630814555557 | 0.28 |
| 12.833694323111112 | 0.33 |
| 12.83675366477778 | 0.26 |
| 12.839814117583334 | 0.28 |
| 12.842877070555554 | 0.2 |
| 12.845946968361112 | 0.37 |
| 12.849011032527779 | 0.38 |
| 12.852072874305554 | 0.49 |
| 12.855138605222223 | 0.38 |
| 12.858199058055556 | 0.43 |
| 12.861260066444444 | 0.29 |
| 12.86431940811111 | 0.39 |
| 12.867383194444445 | 0.07 |
| 12.870444480666666 | 0.29 |
| 12.873510211555555 | 0.07 |
| 12.876573164527777 | 0.38 |
| 12.879632506194444 | 0.01 |
| 12.882698514888888 | 0.42 |
| 12.885776468722222 | 0.33 |
| 12.88883581036111 | 0.42 |
| 12.8918998745 | 0.27 |
| 12.894961994083333 | 0.23 |
| 12.898023280305555 | 0.24 |
| 12.901112623666666 | 0.2 |
| 12.904182799277777 | 0.34 |
| 12.907247418999999 | 0.21 |
| 12.910308149611112 | 0.12 |
| 12.913375547277777 | 0.47 |
| 12.916438222472223 | 0.2 |
| 12.919503397777778 | 0.24 |
| 12.922564684 | 0.4 |
| 12.925625136805557 | 0.51 |
| 12.928698368138889 | 0.24 |
| 12.931761043333333 | 0.42 |
| 12.93482455188889 | 0.08 |
| 12.937885004694445 | 0.02 |
| 12.940946290916667 | 0.19 |
| 12.944008966083333 | 0.4 |
| 12.947069141111111 | 0.56 |
| 12.950134316444444 | 0.37 |
| 12.953195047055557 | -0.01 |
| 12.956269667361111 | 0.41 |
| 12.959354288222222 | 0.25 |
| 12.96241529663889 | 0.59 |
| 12.965478527416668 | 0.39 |
| 12.968543147138888 | 0.53 |
| 12.971606100111112 | 0.41 |
| 12.974665719555556 | 0.29 |
| 12.97773561736111 | 0.42 |
| 12.980794959027778 | 0.22 |
| 12.983855134055554 | 0.4 |
| 12.986921698333333 | 0.42 |
| 12.989981317777778 | 0.39 |
| 12.993046770888888 | 0.18 |
| 12.996115835305556 | 0.47 |
| 12.999187955472221 | 0.37 |
| 13.002248408305556 | 0.29 |
| 13.00532302861111 | 0.43 |
| 13.008382648055557 | 0.49 |
| 13.011443378666668 | 0.31 |
| 13.014510776333335 | 0.38 |
| 13.017577896222223 | 0.57 |
| 13.020640015805556 | 0.28 |
| 13.023711858166665 | 0.37 |
| 13.026781478194444 | 0.36 |
| 13.02984109763889 | 0.19 |
| 13.032902939416665 | 0.18 |
| 13.03597144825 | 0.52 |
| 13.039031623305556 | 0.46 |
| 13.04209374288889 | 0.18 |
| 13.045153640111112 | 0.24 |
| 13.048247705972221 | 0.37 |
| 13.051307603222222 | 0.22 |
| 13.05436777825 | 0.3 |
| 13.057432953555557 | 0.35 |
| 13.060492850805556 | 0.28 |
| 13.063554137 | 0.31 |
| 13.06663153525 | 0.29 |
| 13.069701155277778 | 0.23 |
| 13.072767719555555 | 0.29 |
| 13.075828172388889 | 0.28 |
| 13.078889180805556 | 0.41 |
| 13.08195213375 | 0.4 |
| 13.085012308805556 | 0.34 |
| 13.088071372666667 | 0.54 |
| 13.091142937222221 | 0.32 |
| 13.094202834472222 | 0.32 |
| 13.09727023213889 | 0.12 |
| 13.100358464333333 | 0.13 |
| 13.103422250666666 | 0.45 |
| 13.106488259361111 | 0.21 |
| 13.109553712472223 | 0.51 |
| 13.112619165583334 | 0.15 |
| 13.115685174305556 | 0.45 |
| 13.118744515944444 | 0.23 |
| 13.121806635527777 | 0.2 |
| 13.12486792175 | 0.45 |
| 13.127934208222221 | 0.21 |
| 13.13102355161111 | 0.19 |
| 13.13408456 | 0.29 |
| 13.137157235750001 | 0.58 |
| 13.140222966666666 | 0.38 |
| 13.143289253166667 | 0.52 |
| 13.146356650833333 | 0.44 |
| 13.149426270833333 | -0.02 |
| 13.152516725388889 | 0.25 |
| 13.155577733805554 | 0.51 |
| 13.158640131166667 | 0.27 |
| 13.16170141738889 | 0.37 |
| 13.164763259166666 | 0.23 |
| 13.167832323611112 | 0.32 |
| 13.170894721 | 0.29 |
| 13.173966841138888 | 0.31 |
| 13.177036183361112 | 0.2 |
| 13.18009858075 | 0.17 |
| 13.183160422555554 | 0.21 |
| 13.186220319777778 | 0.29 |
| 13.189282717166668 | 0.59 |
| 13.19234400336111 | 0.52 |
| 13.195404178416666 | 0.32 |
| 13.198465742416667 | 0.42 |
| 13.20152952875 | 0.24 |
| 13.20459025936111 | 0.19 |
| 13.207676547 | 0.35 |
| 13.210741166750001 | 0.29 |
| 13.21382578761111 | 0.49 |
| 13.216886240444445 | 0.49 |
| 13.219948915611111 | 0.3 |
| 13.223010479611112 | 0.38 |
| 13.226071210250002 | 0.36 |
| 13.229135274388888 | 0.48 |
| 13.232197949555555 | 0.23 |
| 13.235260346944445 | 0.55 |
| 13.238320244166665 | 0.28 |
| 13.241380419194446 | 0.29 |
| 13.244440316444443 | 0.38 |
| 13.247502436027776 | 0.26 |
| 13.250571222666666 | 0.4 |
| 13.253633620055556 | 0.52 |
| 13.256698239777776 | 0.44 |
| 13.259757581444445 | 0.26 |
| 13.262817200888888 | 0.1 |
| 13.265876264722221 | 0.38 |
| 13.268936717555555 | 0.44 |
| 13.271996059222221 | 0.31 |
| 13.275059012166668 | 0.45 |
| 13.278122242944445 | 0.03 |
| 13.281187696055555 | 0.27 |
| 13.284247315499998 | 0.03 |
| 13.287307490527779 | 0.55 |
| 13.290369887916667 | 0.32 |
| 13.293430896333332 | 0.3 |
| 13.29649607163889 | 0.12 |
| 13.29957096975 | 0.33 |
| 13.302638922999998 | 0.19 |
| 13.305698264638888 | 0.14 |
| 13.308760939805556 | 0.27 |
| 13.311822781611111 | 0.23 |
| 13.31489240163889 | 0.19 |
| 13.317954243416667 | 0.24 |
| 13.321016918611111 | 0.43 |
| 13.324080982749999 | 0.36 |
| 13.327142546749998 | 0.2 |
| 13.330201888388888 | 0.03 |
| 13.333268452666667 | 0.29 |
| 13.336328349916668 | 0.2 |
| 13.33938796936111 | 0.28 |
| 13.342448699972222 | 0.23 |
| 13.345513875305555 | 0.05 |
| 13.348574883722224 | 0.14 |
| 13.351636169916668 | 0.35 |
| 13.354698567305556 | 0.41 |
| 13.357759297916667 | 0.18 |
| 13.360818917361112 | 0.26 |
| 13.363882703722224 | 0.24 |
| 13.366942045361112 | 0.13 |
| 13.370001387027777 | 0.31 |
| 13.373061839833333 | 0.32 |
| 13.376123126055557 | 0.24 |
| 13.379185523416666 | 0.19 |
| 13.382244587277778 | 0.25 |
| 13.385309762611111 | 0.2 |
| 13.388371882194445 | 0.26 |
| 13.39143316838889 | 0.47 |
| 13.394492510055557 | 0.37 |
| 13.397554074055556 | 0.52 |
| 13.40061536025 | 0.3 |
| 13.40367609088889 | 0.18 |
| 13.406735154722222 | 0.41 |
| 13.409795607555557 | 0.4 |
| 13.412858282722222 | 0.22 |
| 13.415918457777778 | 0.52 |
| 13.418981410722223 | 0.51 |
| 13.422041030166666 | 0.05 |
| 13.42510231638889 | 0.3 |
| 13.4281677695 | 0.29 |
| 13.43122711113889 | 0.22 |
| 13.434288397361112 | 0.23 |
| 13.437348016805556 | 0.28 |
| 13.440407358444444 | 0.43 |
| 13.443469478027778 | 0.56 |
| 13.446532153222224 | 0.6 |
| 13.449592050444444 | 0.47 |
| 13.452653336666666 | 0.48 |
| 13.455713789472224 | 0.51 |
| 13.458775075694444 | 0.25 |
| 13.461848029222221 | 0.32 |
| 13.464915426888888 | 0.37 |
| 13.467974768555555 | 0.48 |
| 13.47103855488889 | 0.4 |
| 13.474098174333333 | 0.36 |
| 13.47715918275 | 0.46 |
| 13.480225747055556 | 0.23 |
| 13.483289255611112 | 0.11 |
| 13.486349708416666 | 0.54 |
| 13.48941266138889 | 0.33 |
| 13.492480336861112 | 0.41 |
| 13.495552179222221 | 0.08 |
| 13.498614576611113 | 0.48 |
| 13.501680585305557 | -0.18 |
| 13.504741593722223 | 0.36 |
| 13.507813436083334 | 0.06 |
| 13.51087361111111 | 0.24 |
| 13.513933230555557 | 0.36 |
| 13.516993127805554 | 0.24 |
| 13.5200591365 | 0.33 |
| 13.52312208947222 | 0.12 |
| 13.526182820083333 | 0.53 |
| 13.529242995111112 | 0.23 |
| 13.5323053925 | 0.17 |
| 13.535365845333333 | 0.18 |
| 13.538425464777779 | 0.3 |
| 13.541491195666666 | 0.26 |
| 13.544552204083333 | 0.43 |
| 13.547626824388889 | 0.1 |
| 13.55068588825 | 0.2 |
| 13.55374745225 | 0.23 |
| 13.556818461222223 | 0.14 |
| 13.559883080972224 | 0.3 |
| 13.562944922749999 | 0.35 |
| 13.566004542194444 | 0.08 |
| 13.569066106194445 | 0.02 |
| 13.572126281222223 | 0.14 |
| 13.575187011861113 | 0.27 |
| 13.578246631305555 | 0.12 |
| 13.581314584555557 | 0.23 |
| 13.584387815888888 | 0.21 |
| 13.587449102083333 | 0.51 |
| 13.59050844375 | 0.21 |
| 13.593587786527777 | 0.07 |
| 13.596649350527779 | 0.37 |
| 13.599710081166666 | 0.3 |
| 13.602769422805554 | 0.22 |
| 13.605829597833333 | 0.47 |
| 13.608893384194445 | 0.17 |
| 13.611953281416667 | 0.42 |
| 13.615016512194444 | 0.48 |
| 13.618088076749999 | 0.45 |
| 13.621151029722222 | 0.35 |
| 13.624217316222223 | 0.23 |
| 13.627287214027778 | 0.37 |
| 13.630349889222222 | 0.31 |
| 13.633410342027778 | 0.32 |
| 13.636471072666668 | 0.59 |
| 13.63953402561111 | 0.61 |
| 13.642595867416667 | 0.34 |
| 13.645682710638889 | 0.47 |
| 13.648744274638888 | 0.2 |
| 13.651809172166665 | 0.45 |
| 13.65487045836111 | 0.79 |
| 13.657930633416667 | 0.38 |
| 13.660991364027778 | 0.59 |
| 13.664054594777777 | 0.46 |
| 13.667114214222222 | 0.26 |
| 13.67017827836111 | 0.23 |
| 13.673240953555556 | 0.29 |
| 13.676300850777778 | 0.55 |
| 13.679361859194444 | 0.29 |
| 13.682421478638888 | 0.46 |
| 13.6854805425 | 0.39 |
| 13.688540717527777 | 0.31 |
| 13.6916036705 | 0.32 |
| 13.694666901277778 | 0.27 |
| 13.697739854805556 | 0.1 |
| 13.700800307638888 | 0.54 |
| 13.703861316055557 | 0.34 |
| 13.706927046944445 | 0.42 |
| 13.709988610944444 | 0.38 |
| 13.713054897444444 | 0.27 |
| 13.71611590586111 | 0.45 |
| 13.719177192055556 | 0.38 |
| 13.722242922972223 | 0.19 |
| 13.725304486972222 | 0.47 |
| 13.728366606555555 | 0.33 |
| 13.731426503805556 | 0.26 |
| 13.734485845444445 | 0.36 |
| 13.737548798416666 | 0.35 |
| 13.740613695944445 | 0.32 |
| 13.74367498213889 | 0.52 |
| 13.746736546138889 | 0.31 |
| 13.749796165583332 | 0.27 |
| 13.752859396361112 | 0.31 |
| 13.755923738277778 | 0.41 |
| 13.758993913888888 | 0.1 |
| 13.76205686686111 | 0.35 |
| 13.765118430861111 | 0.25 |
| 13.768181661638888 | 0.4 |
| 13.771242947833333 | 0.39 |
| 13.774304511833332 | 0.26 |
| 13.777367742583333 | 0.43 |
| 13.780433195694444 | 0.23 |
| 13.783495315305556 | 0.07 |
| 13.786555490333333 | 0.21 |
| 13.789617332111112 | 0.42 |
| 13.79267750713889 | 0.27 |
| 13.795742682472222 | 0.22 |
| 13.798807302194444 | 0.26 |
| 13.801866643861112 | 0.33 |
| 13.8049259855 | -0.02 |
| 13.807987271722222 | 0.09 |
| 13.811050780277776 | 0.51 |
| 13.81411234427778 | 0.44 |
| 13.817175019444445 | 0.04 |
| 13.820235194472223 | 0.53 |
| 13.823296480666666 | 0.21 |
| 13.826358044666668 | 0.52 |
| 13.829421553222224 | 0.13 |
| 13.832482561638889 | 0.26 |
| 13.835545236833333 | 0.34 |
| 13.838605967444446 | 0.15 |